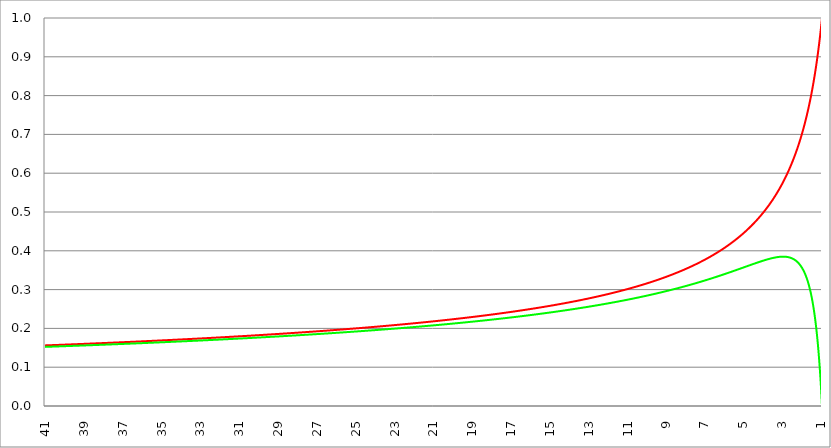
| Category | Series 1 | Series 0 | Series 2 |
|---|---|---|---|
| 41.0 | 0.156 | 0.152 |  |
| 40.98 | 0.156 | 0.152 |  |
| 40.96 | 0.156 | 0.152 |  |
| 40.94 | 0.156 | 0.152 |  |
| 40.91999999999999 | 0.156 | 0.153 |  |
| 40.89999999999998 | 0.156 | 0.153 |  |
| 40.87999999999998 | 0.156 | 0.153 |  |
| 40.85999999999998 | 0.156 | 0.153 |  |
| 40.83999999999997 | 0.156 | 0.153 |  |
| 40.81999999999997 | 0.157 | 0.153 |  |
| 40.79999999999996 | 0.157 | 0.153 |  |
| 40.77999999999996 | 0.157 | 0.153 |  |
| 40.75999999999996 | 0.157 | 0.153 |  |
| 40.73999999999995 | 0.157 | 0.153 |  |
| 40.71999999999995 | 0.157 | 0.153 |  |
| 40.69999999999995 | 0.157 | 0.153 |  |
| 40.67999999999994 | 0.157 | 0.153 |  |
| 40.65999999999994 | 0.157 | 0.153 |  |
| 40.63999999999994 | 0.157 | 0.153 |  |
| 40.61999999999994 | 0.157 | 0.153 |  |
| 40.59999999999993 | 0.157 | 0.153 |  |
| 40.57999999999993 | 0.157 | 0.153 |  |
| 40.55999999999993 | 0.157 | 0.153 |  |
| 40.53999999999992 | 0.157 | 0.153 |  |
| 40.51999999999992 | 0.157 | 0.153 |  |
| 40.49999999999992 | 0.157 | 0.153 |  |
| 40.47999999999992 | 0.157 | 0.153 |  |
| 40.45999999999992 | 0.157 | 0.153 |  |
| 40.43999999999991 | 0.157 | 0.153 |  |
| 40.41999999999991 | 0.157 | 0.153 |  |
| 40.3999999999999 | 0.157 | 0.153 |  |
| 40.3799999999999 | 0.157 | 0.153 |  |
| 40.3599999999999 | 0.157 | 0.154 |  |
| 40.3399999999999 | 0.157 | 0.154 |  |
| 40.3199999999999 | 0.157 | 0.154 |  |
| 40.2999999999999 | 0.158 | 0.154 |  |
| 40.27999999999988 | 0.158 | 0.154 |  |
| 40.25999999999988 | 0.158 | 0.154 |  |
| 40.23999999999988 | 0.158 | 0.154 |  |
| 40.21999999999987 | 0.158 | 0.154 |  |
| 40.19999999999987 | 0.158 | 0.154 |  |
| 40.17999999999987 | 0.158 | 0.154 |  |
| 40.15999999999987 | 0.158 | 0.154 |  |
| 40.13999999999986 | 0.158 | 0.154 |  |
| 40.11999999999986 | 0.158 | 0.154 |  |
| 40.09999999999985 | 0.158 | 0.154 |  |
| 40.07999999999985 | 0.158 | 0.154 |  |
| 40.05999999999985 | 0.158 | 0.154 |  |
| 40.03999999999984 | 0.158 | 0.154 |  |
| 40.01999999999984 | 0.158 | 0.154 |  |
| 39.99999999999984 | 0.158 | 0.154 |  |
| 39.97999999999984 | 0.158 | 0.154 |  |
| 39.95999999999984 | 0.158 | 0.154 |  |
| 39.93999999999983 | 0.158 | 0.154 |  |
| 39.91999999999983 | 0.158 | 0.154 |  |
| 39.89999999999982 | 0.158 | 0.154 |  |
| 39.87999999999982 | 0.158 | 0.154 |  |
| 39.85999999999982 | 0.158 | 0.154 |  |
| 39.83999999999982 | 0.158 | 0.154 |  |
| 39.81999999999982 | 0.158 | 0.154 |  |
| 39.7999999999998 | 0.159 | 0.155 |  |
| 39.7799999999998 | 0.159 | 0.155 |  |
| 39.7599999999998 | 0.159 | 0.155 |  |
| 39.7399999999998 | 0.159 | 0.155 |  |
| 39.7199999999998 | 0.159 | 0.155 |  |
| 39.6999999999998 | 0.159 | 0.155 |  |
| 39.6799999999998 | 0.159 | 0.155 |  |
| 39.6599999999998 | 0.159 | 0.155 |  |
| 39.63999999999978 | 0.159 | 0.155 |  |
| 39.61999999999978 | 0.159 | 0.155 |  |
| 39.59999999999978 | 0.159 | 0.155 |  |
| 39.57999999999977 | 0.159 | 0.155 |  |
| 39.55999999999977 | 0.159 | 0.155 |  |
| 39.53999999999977 | 0.159 | 0.155 |  |
| 39.51999999999977 | 0.159 | 0.155 |  |
| 39.49999999999976 | 0.159 | 0.155 |  |
| 39.47999999999976 | 0.159 | 0.155 |  |
| 39.45999999999976 | 0.159 | 0.155 |  |
| 39.43999999999975 | 0.159 | 0.155 |  |
| 39.41999999999975 | 0.159 | 0.155 |  |
| 39.39999999999974 | 0.159 | 0.155 |  |
| 39.37999999999974 | 0.159 | 0.155 |  |
| 39.35999999999974 | 0.159 | 0.155 |  |
| 39.33999999999974 | 0.159 | 0.155 |  |
| 39.31999999999974 | 0.159 | 0.155 |  |
| 39.29999999999973 | 0.16 | 0.155 |  |
| 39.27999999999973 | 0.16 | 0.155 |  |
| 39.25999999999972 | 0.16 | 0.156 |  |
| 39.23999999999972 | 0.16 | 0.156 |  |
| 39.21999999999972 | 0.16 | 0.156 |  |
| 39.19999999999971 | 0.16 | 0.156 |  |
| 39.17999999999971 | 0.16 | 0.156 |  |
| 39.15999999999971 | 0.16 | 0.156 |  |
| 39.1399999999997 | 0.16 | 0.156 |  |
| 39.1199999999997 | 0.16 | 0.156 |  |
| 39.0999999999997 | 0.16 | 0.156 |  |
| 39.0799999999997 | 0.16 | 0.156 |  |
| 39.0599999999997 | 0.16 | 0.156 |  |
| 39.0399999999997 | 0.16 | 0.156 |  |
| 39.0199999999997 | 0.16 | 0.156 |  |
| 38.99999999999969 | 0.16 | 0.156 |  |
| 38.97999999999968 | 0.16 | 0.156 |  |
| 38.95999999999968 | 0.16 | 0.156 |  |
| 38.93999999999968 | 0.16 | 0.156 |  |
| 38.91999999999967 | 0.16 | 0.156 |  |
| 38.89999999999967 | 0.16 | 0.156 |  |
| 38.87999999999967 | 0.16 | 0.156 |  |
| 38.85999999999967 | 0.16 | 0.156 |  |
| 38.83999999999966 | 0.16 | 0.156 |  |
| 38.81999999999966 | 0.16 | 0.156 |  |
| 38.79999999999965 | 0.161 | 0.156 |  |
| 38.77999999999965 | 0.161 | 0.156 |  |
| 38.75999999999965 | 0.161 | 0.156 |  |
| 38.73999999999964 | 0.161 | 0.157 |  |
| 38.71999999999964 | 0.161 | 0.157 |  |
| 38.69999999999964 | 0.161 | 0.157 |  |
| 38.67999999999964 | 0.161 | 0.157 |  |
| 38.65999999999963 | 0.161 | 0.157 |  |
| 38.63999999999963 | 0.161 | 0.157 |  |
| 38.61999999999963 | 0.161 | 0.157 |  |
| 38.59999999999962 | 0.161 | 0.157 |  |
| 38.57999999999962 | 0.161 | 0.157 |  |
| 38.55999999999962 | 0.161 | 0.157 |  |
| 38.53999999999962 | 0.161 | 0.157 |  |
| 38.51999999999961 | 0.161 | 0.157 |  |
| 38.49999999999961 | 0.161 | 0.157 |  |
| 38.47999999999961 | 0.161 | 0.157 |  |
| 38.4599999999996 | 0.161 | 0.157 |  |
| 38.4399999999996 | 0.161 | 0.157 |  |
| 38.4199999999996 | 0.161 | 0.157 |  |
| 38.3999999999996 | 0.161 | 0.157 |  |
| 38.3799999999996 | 0.161 | 0.157 |  |
| 38.35999999999959 | 0.161 | 0.157 |  |
| 38.33999999999958 | 0.162 | 0.157 |  |
| 38.31999999999958 | 0.162 | 0.157 |  |
| 38.29999999999957 | 0.162 | 0.157 |  |
| 38.27999999999957 | 0.162 | 0.157 |  |
| 38.25999999999957 | 0.162 | 0.157 |  |
| 38.23999999999957 | 0.162 | 0.157 |  |
| 38.21999999999957 | 0.162 | 0.158 |  |
| 38.19999999999956 | 0.162 | 0.158 |  |
| 38.17999999999956 | 0.162 | 0.158 |  |
| 38.15999999999956 | 0.162 | 0.158 |  |
| 38.13999999999955 | 0.162 | 0.158 |  |
| 38.11999999999955 | 0.162 | 0.158 |  |
| 38.09999999999954 | 0.162 | 0.158 |  |
| 38.07999999999954 | 0.162 | 0.158 |  |
| 38.05999999999954 | 0.162 | 0.158 |  |
| 38.03999999999954 | 0.162 | 0.158 |  |
| 38.01999999999953 | 0.162 | 0.158 |  |
| 37.99999999999953 | 0.162 | 0.158 |  |
| 37.97999999999953 | 0.162 | 0.158 |  |
| 37.95999999999952 | 0.162 | 0.158 |  |
| 37.93999999999952 | 0.162 | 0.158 |  |
| 37.91999999999952 | 0.162 | 0.158 |  |
| 37.89999999999952 | 0.162 | 0.158 |  |
| 37.87999999999951 | 0.162 | 0.158 |  |
| 37.85999999999951 | 0.163 | 0.158 |  |
| 37.83999999999951 | 0.163 | 0.158 |  |
| 37.8199999999995 | 0.163 | 0.158 |  |
| 37.7999999999995 | 0.163 | 0.158 |  |
| 37.7799999999995 | 0.163 | 0.158 |  |
| 37.7599999999995 | 0.163 | 0.158 |  |
| 37.7399999999995 | 0.163 | 0.158 |  |
| 37.71999999999949 | 0.163 | 0.159 |  |
| 37.69999999999948 | 0.163 | 0.159 |  |
| 37.67999999999948 | 0.163 | 0.159 |  |
| 37.65999999999948 | 0.163 | 0.159 |  |
| 37.63999999999947 | 0.163 | 0.159 |  |
| 37.61999999999947 | 0.163 | 0.159 |  |
| 37.59999999999947 | 0.163 | 0.159 |  |
| 37.57999999999947 | 0.163 | 0.159 |  |
| 37.55999999999946 | 0.163 | 0.159 |  |
| 37.53999999999946 | 0.163 | 0.159 |  |
| 37.51999999999946 | 0.163 | 0.159 |  |
| 37.49999999999945 | 0.163 | 0.159 |  |
| 37.47999999999945 | 0.163 | 0.159 |  |
| 37.45999999999945 | 0.163 | 0.159 |  |
| 37.43999999999944 | 0.163 | 0.159 |  |
| 37.41999999999944 | 0.163 | 0.159 |  |
| 37.39999999999944 | 0.164 | 0.159 |  |
| 37.37999999999943 | 0.164 | 0.159 |  |
| 37.35999999999943 | 0.164 | 0.159 |  |
| 37.33999999999943 | 0.164 | 0.159 |  |
| 37.31999999999942 | 0.164 | 0.159 |  |
| 37.29999999999942 | 0.164 | 0.159 |  |
| 37.27999999999942 | 0.164 | 0.159 |  |
| 37.25999999999942 | 0.164 | 0.159 |  |
| 37.23999999999941 | 0.164 | 0.159 |  |
| 37.21999999999941 | 0.164 | 0.16 |  |
| 37.1999999999994 | 0.164 | 0.16 |  |
| 37.1799999999994 | 0.164 | 0.16 |  |
| 37.1599999999994 | 0.164 | 0.16 |  |
| 37.1399999999994 | 0.164 | 0.16 |  |
| 37.1199999999994 | 0.164 | 0.16 |  |
| 37.0999999999994 | 0.164 | 0.16 |  |
| 37.07999999999939 | 0.164 | 0.16 |  |
| 37.05999999999938 | 0.164 | 0.16 |  |
| 37.03999999999938 | 0.164 | 0.16 |  |
| 37.01999999999938 | 0.164 | 0.16 |  |
| 36.99999999999937 | 0.164 | 0.16 |  |
| 36.97999999999937 | 0.164 | 0.16 |  |
| 36.95999999999937 | 0.164 | 0.16 |  |
| 36.93999999999937 | 0.165 | 0.16 |  |
| 36.91999999999936 | 0.165 | 0.16 |  |
| 36.89999999999936 | 0.165 | 0.16 |  |
| 36.87999999999936 | 0.165 | 0.16 |  |
| 36.85999999999935 | 0.165 | 0.16 |  |
| 36.83999999999935 | 0.165 | 0.16 |  |
| 36.81999999999935 | 0.165 | 0.16 |  |
| 36.79999999999934 | 0.165 | 0.16 |  |
| 36.77999999999934 | 0.165 | 0.16 |  |
| 36.75999999999934 | 0.165 | 0.16 |  |
| 36.73999999999933 | 0.165 | 0.16 |  |
| 36.71999999999933 | 0.165 | 0.161 |  |
| 36.69999999999932 | 0.165 | 0.161 |  |
| 36.67999999999932 | 0.165 | 0.161 |  |
| 36.65999999999932 | 0.165 | 0.161 |  |
| 36.63999999999932 | 0.165 | 0.161 |  |
| 36.61999999999932 | 0.165 | 0.161 |  |
| 36.59999999999931 | 0.165 | 0.161 |  |
| 36.57999999999931 | 0.165 | 0.161 |  |
| 36.55999999999931 | 0.165 | 0.161 |  |
| 36.5399999999993 | 0.165 | 0.161 |  |
| 36.5199999999993 | 0.165 | 0.161 |  |
| 36.4999999999993 | 0.166 | 0.161 |  |
| 36.4799999999993 | 0.166 | 0.161 |  |
| 36.4599999999993 | 0.166 | 0.161 |  |
| 36.43999999999929 | 0.166 | 0.161 |  |
| 36.41999999999928 | 0.166 | 0.161 |  |
| 36.39999999999928 | 0.166 | 0.161 |  |
| 36.37999999999928 | 0.166 | 0.161 |  |
| 36.35999999999927 | 0.166 | 0.161 |  |
| 36.33999999999927 | 0.166 | 0.161 |  |
| 36.31999999999927 | 0.166 | 0.161 |  |
| 36.29999999999926 | 0.166 | 0.161 |  |
| 36.27999999999926 | 0.166 | 0.161 |  |
| 36.25999999999926 | 0.166 | 0.161 |  |
| 36.23999999999925 | 0.166 | 0.162 |  |
| 36.21999999999925 | 0.166 | 0.162 |  |
| 36.19999999999924 | 0.166 | 0.162 |  |
| 36.17999999999924 | 0.166 | 0.162 |  |
| 36.15999999999924 | 0.166 | 0.162 |  |
| 36.13999999999924 | 0.166 | 0.162 |  |
| 36.11999999999924 | 0.166 | 0.162 |  |
| 36.09999999999923 | 0.166 | 0.162 |  |
| 36.07999999999923 | 0.166 | 0.162 |  |
| 36.05999999999923 | 0.167 | 0.162 |  |
| 36.03999999999922 | 0.167 | 0.162 |  |
| 36.01999999999922 | 0.167 | 0.162 |  |
| 35.99999999999922 | 0.167 | 0.162 |  |
| 35.97999999999922 | 0.167 | 0.162 |  |
| 35.95999999999921 | 0.167 | 0.162 |  |
| 35.93999999999921 | 0.167 | 0.162 |  |
| 35.91999999999921 | 0.167 | 0.162 |  |
| 35.8999999999992 | 0.167 | 0.162 |  |
| 35.8799999999992 | 0.167 | 0.162 |  |
| 35.8599999999992 | 0.167 | 0.162 |  |
| 35.8399999999992 | 0.167 | 0.162 |  |
| 35.8199999999992 | 0.167 | 0.162 |  |
| 35.79999999999918 | 0.167 | 0.162 |  |
| 35.77999999999918 | 0.167 | 0.163 |  |
| 35.75999999999918 | 0.167 | 0.163 |  |
| 35.73999999999917 | 0.167 | 0.163 |  |
| 35.71999999999917 | 0.167 | 0.163 |  |
| 35.69999999999917 | 0.167 | 0.163 |  |
| 35.67999999999917 | 0.167 | 0.163 |  |
| 35.65999999999917 | 0.167 | 0.163 |  |
| 35.63999999999916 | 0.168 | 0.163 |  |
| 35.61999999999916 | 0.168 | 0.163 |  |
| 35.59999999999915 | 0.168 | 0.163 |  |
| 35.57999999999915 | 0.168 | 0.163 |  |
| 35.55999999999915 | 0.168 | 0.163 |  |
| 35.53999999999914 | 0.168 | 0.163 |  |
| 35.51999999999914 | 0.168 | 0.163 |  |
| 35.49999999999914 | 0.168 | 0.163 |  |
| 35.47999999999914 | 0.168 | 0.163 |  |
| 35.45999999999913 | 0.168 | 0.163 |  |
| 35.43999999999913 | 0.168 | 0.163 |  |
| 35.41999999999913 | 0.168 | 0.163 |  |
| 35.39999999999912 | 0.168 | 0.163 |  |
| 35.37999999999912 | 0.168 | 0.163 |  |
| 35.35999999999912 | 0.168 | 0.163 |  |
| 35.33999999999912 | 0.168 | 0.163 |  |
| 35.31999999999911 | 0.168 | 0.163 |  |
| 35.2999999999991 | 0.168 | 0.164 |  |
| 35.2799999999991 | 0.168 | 0.164 |  |
| 35.2599999999991 | 0.168 | 0.164 |  |
| 35.2399999999991 | 0.168 | 0.164 |  |
| 35.2199999999991 | 0.169 | 0.164 |  |
| 35.1999999999991 | 0.169 | 0.164 |  |
| 35.1799999999991 | 0.169 | 0.164 |  |
| 35.15999999999909 | 0.169 | 0.164 |  |
| 35.13999999999908 | 0.169 | 0.164 |  |
| 35.11999999999908 | 0.169 | 0.164 |  |
| 35.09999999999907 | 0.169 | 0.164 |  |
| 35.07999999999907 | 0.169 | 0.164 |  |
| 35.05999999999907 | 0.169 | 0.164 |  |
| 35.03999999999907 | 0.169 | 0.164 |  |
| 35.01999999999907 | 0.169 | 0.164 |  |
| 34.99999999999906 | 0.169 | 0.164 |  |
| 34.97999999999906 | 0.169 | 0.164 |  |
| 34.95999999999906 | 0.169 | 0.164 |  |
| 34.93999999999905 | 0.169 | 0.164 |  |
| 34.91999999999905 | 0.169 | 0.164 |  |
| 34.89999999999904 | 0.169 | 0.164 |  |
| 34.87999999999904 | 0.169 | 0.164 |  |
| 34.85999999999904 | 0.169 | 0.165 |  |
| 34.83999999999904 | 0.169 | 0.165 |  |
| 34.81999999999903 | 0.169 | 0.165 |  |
| 34.79999999999903 | 0.17 | 0.165 |  |
| 34.77999999999902 | 0.17 | 0.165 |  |
| 34.75999999999902 | 0.17 | 0.165 |  |
| 34.73999999999902 | 0.17 | 0.165 |  |
| 34.71999999999902 | 0.17 | 0.165 |  |
| 34.69999999999901 | 0.17 | 0.165 |  |
| 34.67999999999901 | 0.17 | 0.165 |  |
| 34.65999999999901 | 0.17 | 0.165 |  |
| 34.639999999999 | 0.17 | 0.165 |  |
| 34.619999999999 | 0.17 | 0.165 |  |
| 34.599999999999 | 0.17 | 0.165 |  |
| 34.579999999999 | 0.17 | 0.165 |  |
| 34.559999999999 | 0.17 | 0.165 |  |
| 34.539999999999 | 0.17 | 0.165 |  |
| 34.51999999999899 | 0.17 | 0.165 |  |
| 34.49999999999898 | 0.17 | 0.165 |  |
| 34.47999999999898 | 0.17 | 0.165 |  |
| 34.45999999999898 | 0.17 | 0.165 |  |
| 34.43999999999897 | 0.17 | 0.165 |  |
| 34.41999999999897 | 0.17 | 0.165 |  |
| 34.39999999999897 | 0.17 | 0.166 |  |
| 34.37999999999897 | 0.171 | 0.166 |  |
| 34.35999999999896 | 0.171 | 0.166 |  |
| 34.33999999999896 | 0.171 | 0.166 |  |
| 34.31999999999896 | 0.171 | 0.166 |  |
| 34.29999999999895 | 0.171 | 0.166 |  |
| 34.27999999999894 | 0.171 | 0.166 |  |
| 34.25999999999894 | 0.171 | 0.166 |  |
| 34.23999999999894 | 0.171 | 0.166 |  |
| 34.21999999999894 | 0.171 | 0.166 |  |
| 34.19999999999893 | 0.171 | 0.166 |  |
| 34.17999999999893 | 0.171 | 0.166 |  |
| 34.15999999999893 | 0.171 | 0.166 |  |
| 34.13999999999892 | 0.171 | 0.166 |  |
| 34.11999999999892 | 0.171 | 0.166 |  |
| 34.09999999999892 | 0.171 | 0.166 |  |
| 34.07999999999892 | 0.171 | 0.166 |  |
| 34.05999999999892 | 0.171 | 0.166 |  |
| 34.03999999999891 | 0.171 | 0.166 |  |
| 34.01999999999891 | 0.171 | 0.166 |  |
| 33.9999999999989 | 0.171 | 0.166 |  |
| 33.9799999999989 | 0.172 | 0.167 |  |
| 33.9599999999989 | 0.172 | 0.167 |  |
| 33.9399999999989 | 0.172 | 0.167 |  |
| 33.9199999999989 | 0.172 | 0.167 |  |
| 33.8999999999989 | 0.172 | 0.167 |  |
| 33.87999999999889 | 0.172 | 0.167 |  |
| 33.85999999999888 | 0.172 | 0.167 |  |
| 33.83999999999888 | 0.172 | 0.167 |  |
| 33.81999999999888 | 0.172 | 0.167 |  |
| 33.79999999999887 | 0.172 | 0.167 |  |
| 33.77999999999887 | 0.172 | 0.167 |  |
| 33.75999999999887 | 0.172 | 0.167 |  |
| 33.73999999999886 | 0.172 | 0.167 |  |
| 33.71999999999886 | 0.172 | 0.167 |  |
| 33.69999999999885 | 0.172 | 0.167 |  |
| 33.67999999999885 | 0.172 | 0.167 |  |
| 33.65999999999885 | 0.172 | 0.167 |  |
| 33.63999999999884 | 0.172 | 0.167 |  |
| 33.61999999999884 | 0.172 | 0.167 |  |
| 33.59999999999884 | 0.173 | 0.167 |  |
| 33.57999999999884 | 0.173 | 0.167 |  |
| 33.55999999999884 | 0.173 | 0.167 |  |
| 33.53999999999883 | 0.173 | 0.168 |  |
| 33.51999999999883 | 0.173 | 0.168 |  |
| 33.49999999999882 | 0.173 | 0.168 |  |
| 33.47999999999882 | 0.173 | 0.168 |  |
| 33.45999999999882 | 0.173 | 0.168 |  |
| 33.43999999999882 | 0.173 | 0.168 |  |
| 33.41999999999882 | 0.173 | 0.168 |  |
| 33.39999999999881 | 0.173 | 0.168 |  |
| 33.37999999999881 | 0.173 | 0.168 |  |
| 33.35999999999881 | 0.173 | 0.168 |  |
| 33.3399999999988 | 0.173 | 0.168 |  |
| 33.3199999999988 | 0.173 | 0.168 |  |
| 33.2999999999988 | 0.173 | 0.168 |  |
| 33.2799999999988 | 0.173 | 0.168 |  |
| 33.2599999999988 | 0.173 | 0.168 |  |
| 33.23999999999878 | 0.173 | 0.168 |  |
| 33.21999999999878 | 0.174 | 0.168 |  |
| 33.19999999999878 | 0.174 | 0.168 |  |
| 33.17999999999877 | 0.174 | 0.168 |  |
| 33.15999999999877 | 0.174 | 0.168 |  |
| 33.13999999999877 | 0.174 | 0.168 |  |
| 33.11999999999877 | 0.174 | 0.169 |  |
| 33.09999999999876 | 0.174 | 0.169 |  |
| 33.07999999999876 | 0.174 | 0.169 |  |
| 33.05999999999876 | 0.174 | 0.169 |  |
| 33.03999999999875 | 0.174 | 0.169 |  |
| 33.01999999999875 | 0.174 | 0.169 |  |
| 32.99999999999874 | 0.174 | 0.169 |  |
| 32.97999999999874 | 0.174 | 0.169 |  |
| 32.95999999999874 | 0.174 | 0.169 |  |
| 32.93999999999874 | 0.174 | 0.169 |  |
| 32.91999999999874 | 0.174 | 0.169 |  |
| 32.89999999999873 | 0.174 | 0.169 |  |
| 32.87999999999873 | 0.174 | 0.169 |  |
| 32.85999999999873 | 0.174 | 0.169 |  |
| 32.83999999999872 | 0.175 | 0.169 |  |
| 32.81999999999872 | 0.175 | 0.169 |  |
| 32.79999999999871 | 0.175 | 0.169 |  |
| 32.77999999999871 | 0.175 | 0.169 |  |
| 32.75999999999871 | 0.175 | 0.169 |  |
| 32.7399999999987 | 0.175 | 0.169 |  |
| 32.7199999999987 | 0.175 | 0.169 |  |
| 32.6999999999987 | 0.175 | 0.17 |  |
| 32.6799999999987 | 0.175 | 0.17 |  |
| 32.6599999999987 | 0.175 | 0.17 |  |
| 32.6399999999987 | 0.175 | 0.17 |  |
| 32.61999999999869 | 0.175 | 0.17 |  |
| 32.59999999999869 | 0.175 | 0.17 |  |
| 32.57999999999868 | 0.175 | 0.17 |  |
| 32.55999999999868 | 0.175 | 0.17 |  |
| 32.53999999999868 | 0.175 | 0.17 |  |
| 32.51999999999867 | 0.175 | 0.17 |  |
| 32.49999999999867 | 0.175 | 0.17 |  |
| 32.47999999999867 | 0.175 | 0.17 |  |
| 32.45999999999866 | 0.176 | 0.17 |  |
| 32.43999999999866 | 0.176 | 0.17 |  |
| 32.41999999999866 | 0.176 | 0.17 |  |
| 32.39999999999866 | 0.176 | 0.17 |  |
| 32.37999999999865 | 0.176 | 0.17 |  |
| 32.35999999999865 | 0.176 | 0.17 |  |
| 32.33999999999865 | 0.176 | 0.17 |  |
| 32.31999999999864 | 0.176 | 0.17 |  |
| 32.29999999999864 | 0.176 | 0.171 |  |
| 32.27999999999864 | 0.176 | 0.171 |  |
| 32.25999999999863 | 0.176 | 0.171 |  |
| 32.23999999999863 | 0.176 | 0.171 |  |
| 32.21999999999863 | 0.176 | 0.171 |  |
| 32.19999999999862 | 0.176 | 0.171 |  |
| 32.17999999999862 | 0.176 | 0.171 |  |
| 32.15999999999862 | 0.176 | 0.171 |  |
| 32.13999999999861 | 0.176 | 0.171 |  |
| 32.11999999999861 | 0.176 | 0.171 |  |
| 32.09999999999861 | 0.177 | 0.171 |  |
| 32.07999999999861 | 0.177 | 0.171 |  |
| 32.0599999999986 | 0.177 | 0.171 |  |
| 32.0399999999986 | 0.177 | 0.171 |  |
| 32.0199999999986 | 0.177 | 0.171 |  |
| 31.9999999999986 | 0.177 | 0.171 |  |
| 31.9799999999986 | 0.177 | 0.171 |  |
| 31.9599999999986 | 0.177 | 0.171 |  |
| 31.9399999999986 | 0.177 | 0.171 |  |
| 31.9199999999986 | 0.177 | 0.171 |  |
| 31.8999999999986 | 0.177 | 0.172 |  |
| 31.8799999999986 | 0.177 | 0.172 |  |
| 31.8599999999986 | 0.177 | 0.172 |  |
| 31.8399999999986 | 0.177 | 0.172 |  |
| 31.8199999999986 | 0.177 | 0.172 |  |
| 31.7999999999986 | 0.177 | 0.172 |  |
| 31.7799999999986 | 0.177 | 0.172 |  |
| 31.7599999999986 | 0.177 | 0.172 |  |
| 31.7399999999986 | 0.177 | 0.172 |  |
| 31.7199999999986 | 0.178 | 0.172 |  |
| 31.6999999999986 | 0.178 | 0.172 |  |
| 31.6799999999986 | 0.178 | 0.172 |  |
| 31.6599999999986 | 0.178 | 0.172 |  |
| 31.6399999999986 | 0.178 | 0.172 |  |
| 31.6199999999986 | 0.178 | 0.172 |  |
| 31.59999999999861 | 0.178 | 0.172 |  |
| 31.57999999999861 | 0.178 | 0.172 |  |
| 31.55999999999861 | 0.178 | 0.172 |  |
| 31.53999999999861 | 0.178 | 0.172 |  |
| 31.51999999999861 | 0.178 | 0.172 |  |
| 31.49999999999861 | 0.178 | 0.173 |  |
| 31.47999999999861 | 0.178 | 0.173 |  |
| 31.45999999999861 | 0.178 | 0.173 |  |
| 31.43999999999861 | 0.178 | 0.173 |  |
| 31.41999999999861 | 0.178 | 0.173 |  |
| 31.39999999999861 | 0.178 | 0.173 |  |
| 31.37999999999861 | 0.179 | 0.173 |  |
| 31.35999999999861 | 0.179 | 0.173 |  |
| 31.33999999999861 | 0.179 | 0.173 |  |
| 31.31999999999861 | 0.179 | 0.173 |  |
| 31.29999999999861 | 0.179 | 0.173 |  |
| 31.27999999999861 | 0.179 | 0.173 |  |
| 31.25999999999861 | 0.179 | 0.173 |  |
| 31.23999999999861 | 0.179 | 0.173 |  |
| 31.21999999999861 | 0.179 | 0.173 |  |
| 31.19999999999861 | 0.179 | 0.173 |  |
| 31.17999999999861 | 0.179 | 0.173 |  |
| 31.15999999999861 | 0.179 | 0.173 |  |
| 31.13999999999861 | 0.179 | 0.173 |  |
| 31.11999999999861 | 0.179 | 0.173 |  |
| 31.09999999999862 | 0.179 | 0.174 |  |
| 31.07999999999862 | 0.179 | 0.174 |  |
| 31.05999999999862 | 0.179 | 0.174 |  |
| 31.03999999999862 | 0.179 | 0.174 |  |
| 31.01999999999862 | 0.18 | 0.174 |  |
| 30.99999999999862 | 0.18 | 0.174 |  |
| 30.97999999999862 | 0.18 | 0.174 |  |
| 30.95999999999862 | 0.18 | 0.174 |  |
| 30.93999999999862 | 0.18 | 0.174 |  |
| 30.91999999999862 | 0.18 | 0.174 |  |
| 30.89999999999862 | 0.18 | 0.174 |  |
| 30.87999999999862 | 0.18 | 0.174 |  |
| 30.85999999999862 | 0.18 | 0.174 |  |
| 30.83999999999862 | 0.18 | 0.174 |  |
| 30.81999999999862 | 0.18 | 0.174 |  |
| 30.79999999999862 | 0.18 | 0.174 |  |
| 30.77999999999862 | 0.18 | 0.174 |  |
| 30.75999999999862 | 0.18 | 0.174 |  |
| 30.73999999999862 | 0.18 | 0.174 |  |
| 30.71999999999862 | 0.18 | 0.175 |  |
| 30.69999999999862 | 0.18 | 0.175 |  |
| 30.67999999999862 | 0.181 | 0.175 |  |
| 30.65999999999862 | 0.181 | 0.175 |  |
| 30.63999999999862 | 0.181 | 0.175 |  |
| 30.61999999999862 | 0.181 | 0.175 |  |
| 30.59999999999863 | 0.181 | 0.175 |  |
| 30.57999999999863 | 0.181 | 0.175 |  |
| 30.55999999999863 | 0.181 | 0.175 |  |
| 30.53999999999863 | 0.181 | 0.175 |  |
| 30.51999999999863 | 0.181 | 0.175 |  |
| 30.49999999999863 | 0.181 | 0.175 |  |
| 30.47999999999863 | 0.181 | 0.175 |  |
| 30.45999999999863 | 0.181 | 0.175 |  |
| 30.43999999999863 | 0.181 | 0.175 |  |
| 30.41999999999863 | 0.181 | 0.175 |  |
| 30.39999999999863 | 0.181 | 0.175 |  |
| 30.37999999999863 | 0.181 | 0.175 |  |
| 30.35999999999863 | 0.181 | 0.176 |  |
| 30.33999999999863 | 0.182 | 0.176 |  |
| 30.31999999999863 | 0.182 | 0.176 |  |
| 30.29999999999863 | 0.182 | 0.176 |  |
| 30.27999999999863 | 0.182 | 0.176 |  |
| 30.25999999999863 | 0.182 | 0.176 |  |
| 30.23999999999863 | 0.182 | 0.176 |  |
| 30.21999999999863 | 0.182 | 0.176 |  |
| 30.19999999999864 | 0.182 | 0.176 |  |
| 30.17999999999864 | 0.182 | 0.176 |  |
| 30.15999999999864 | 0.182 | 0.176 |  |
| 30.13999999999864 | 0.182 | 0.176 |  |
| 30.11999999999864 | 0.182 | 0.176 |  |
| 30.09999999999864 | 0.182 | 0.176 |  |
| 30.07999999999864 | 0.182 | 0.176 |  |
| 30.05999999999864 | 0.182 | 0.176 |  |
| 30.03999999999864 | 0.182 | 0.176 |  |
| 30.01999999999864 | 0.183 | 0.176 |  |
| 29.99999999999864 | 0.183 | 0.176 |  |
| 29.97999999999864 | 0.183 | 0.177 |  |
| 29.95999999999864 | 0.183 | 0.177 |  |
| 29.93999999999864 | 0.183 | 0.177 |  |
| 29.91999999999864 | 0.183 | 0.177 |  |
| 29.89999999999864 | 0.183 | 0.177 |  |
| 29.87999999999864 | 0.183 | 0.177 |  |
| 29.85999999999864 | 0.183 | 0.177 |  |
| 29.83999999999864 | 0.183 | 0.177 |  |
| 29.81999999999864 | 0.183 | 0.177 |  |
| 29.79999999999864 | 0.183 | 0.177 |  |
| 29.77999999999864 | 0.183 | 0.177 |  |
| 29.75999999999864 | 0.183 | 0.177 |  |
| 29.73999999999864 | 0.183 | 0.177 |  |
| 29.71999999999865 | 0.183 | 0.177 |  |
| 29.69999999999865 | 0.183 | 0.177 |  |
| 29.67999999999865 | 0.184 | 0.177 |  |
| 29.65999999999865 | 0.184 | 0.177 |  |
| 29.63999999999865 | 0.184 | 0.177 |  |
| 29.61999999999865 | 0.184 | 0.178 |  |
| 29.59999999999865 | 0.184 | 0.178 |  |
| 29.57999999999865 | 0.184 | 0.178 |  |
| 29.55999999999865 | 0.184 | 0.178 |  |
| 29.53999999999865 | 0.184 | 0.178 |  |
| 29.51999999999865 | 0.184 | 0.178 |  |
| 29.49999999999865 | 0.184 | 0.178 |  |
| 29.47999999999865 | 0.184 | 0.178 |  |
| 29.45999999999865 | 0.184 | 0.178 |  |
| 29.43999999999865 | 0.184 | 0.178 |  |
| 29.41999999999865 | 0.184 | 0.178 |  |
| 29.39999999999865 | 0.184 | 0.178 |  |
| 29.37999999999865 | 0.184 | 0.178 |  |
| 29.35999999999865 | 0.185 | 0.178 |  |
| 29.33999999999865 | 0.185 | 0.178 |  |
| 29.31999999999865 | 0.185 | 0.178 |  |
| 29.29999999999865 | 0.185 | 0.178 |  |
| 29.27999999999865 | 0.185 | 0.178 |  |
| 29.25999999999866 | 0.185 | 0.179 |  |
| 29.23999999999866 | 0.185 | 0.179 |  |
| 29.21999999999866 | 0.185 | 0.179 |  |
| 29.19999999999866 | 0.185 | 0.179 |  |
| 29.17999999999866 | 0.185 | 0.179 |  |
| 29.15999999999866 | 0.185 | 0.179 |  |
| 29.13999999999866 | 0.185 | 0.179 |  |
| 29.11999999999866 | 0.185 | 0.179 |  |
| 29.09999999999866 | 0.185 | 0.179 |  |
| 29.07999999999866 | 0.185 | 0.179 |  |
| 29.05999999999866 | 0.186 | 0.179 |  |
| 29.03999999999866 | 0.186 | 0.179 |  |
| 29.01999999999866 | 0.186 | 0.179 |  |
| 28.99999999999866 | 0.186 | 0.179 |  |
| 28.97999999999866 | 0.186 | 0.179 |  |
| 28.95999999999866 | 0.186 | 0.179 |  |
| 28.93999999999866 | 0.186 | 0.179 |  |
| 28.91999999999866 | 0.186 | 0.18 |  |
| 28.89999999999866 | 0.186 | 0.18 |  |
| 28.87999999999866 | 0.186 | 0.18 |  |
| 28.85999999999866 | 0.186 | 0.18 |  |
| 28.83999999999866 | 0.186 | 0.18 |  |
| 28.81999999999866 | 0.186 | 0.18 |  |
| 28.79999999999866 | 0.186 | 0.18 |  |
| 28.77999999999867 | 0.186 | 0.18 |  |
| 28.75999999999867 | 0.186 | 0.18 |  |
| 28.73999999999867 | 0.187 | 0.18 |  |
| 28.71999999999867 | 0.187 | 0.18 |  |
| 28.69999999999867 | 0.187 | 0.18 |  |
| 28.67999999999867 | 0.187 | 0.18 |  |
| 28.65999999999867 | 0.187 | 0.18 |  |
| 28.63999999999867 | 0.187 | 0.18 |  |
| 28.61999999999867 | 0.187 | 0.18 |  |
| 28.59999999999867 | 0.187 | 0.18 |  |
| 28.57999999999867 | 0.187 | 0.181 |  |
| 28.55999999999867 | 0.187 | 0.181 |  |
| 28.53999999999867 | 0.187 | 0.181 |  |
| 28.51999999999867 | 0.187 | 0.181 |  |
| 28.49999999999867 | 0.187 | 0.181 |  |
| 28.47999999999867 | 0.187 | 0.181 |  |
| 28.45999999999867 | 0.187 | 0.181 |  |
| 28.43999999999867 | 0.188 | 0.181 |  |
| 28.41999999999867 | 0.188 | 0.181 |  |
| 28.39999999999867 | 0.188 | 0.181 |  |
| 28.37999999999867 | 0.188 | 0.181 |  |
| 28.35999999999867 | 0.188 | 0.181 |  |
| 28.33999999999867 | 0.188 | 0.181 |  |
| 28.31999999999867 | 0.188 | 0.181 |  |
| 28.29999999999868 | 0.188 | 0.181 |  |
| 28.27999999999868 | 0.188 | 0.181 |  |
| 28.25999999999868 | 0.188 | 0.181 |  |
| 28.23999999999868 | 0.188 | 0.182 |  |
| 28.21999999999868 | 0.188 | 0.182 |  |
| 28.19999999999868 | 0.188 | 0.182 |  |
| 28.17999999999868 | 0.188 | 0.182 |  |
| 28.15999999999868 | 0.188 | 0.182 |  |
| 28.13999999999868 | 0.189 | 0.182 |  |
| 28.11999999999868 | 0.189 | 0.182 |  |
| 28.09999999999868 | 0.189 | 0.182 |  |
| 28.07999999999868 | 0.189 | 0.182 |  |
| 28.05999999999868 | 0.189 | 0.182 |  |
| 28.03999999999868 | 0.189 | 0.182 |  |
| 28.01999999999868 | 0.189 | 0.182 |  |
| 27.99999999999868 | 0.189 | 0.182 |  |
| 27.97999999999868 | 0.189 | 0.182 |  |
| 27.95999999999868 | 0.189 | 0.182 |  |
| 27.93999999999868 | 0.189 | 0.182 |  |
| 27.91999999999868 | 0.189 | 0.182 |  |
| 27.89999999999868 | 0.189 | 0.183 |  |
| 27.87999999999868 | 0.189 | 0.183 |  |
| 27.85999999999868 | 0.189 | 0.183 |  |
| 27.83999999999868 | 0.19 | 0.183 |  |
| 27.81999999999868 | 0.19 | 0.183 |  |
| 27.79999999999869 | 0.19 | 0.183 |  |
| 27.77999999999869 | 0.19 | 0.183 |  |
| 27.75999999999869 | 0.19 | 0.183 |  |
| 27.73999999999869 | 0.19 | 0.183 |  |
| 27.71999999999869 | 0.19 | 0.183 |  |
| 27.69999999999869 | 0.19 | 0.183 |  |
| 27.67999999999869 | 0.19 | 0.183 |  |
| 27.65999999999869 | 0.19 | 0.183 |  |
| 27.63999999999869 | 0.19 | 0.183 |  |
| 27.61999999999869 | 0.19 | 0.183 |  |
| 27.5999999999987 | 0.19 | 0.183 |  |
| 27.5799999999987 | 0.19 | 0.184 |  |
| 27.5599999999987 | 0.19 | 0.184 |  |
| 27.5399999999987 | 0.191 | 0.184 |  |
| 27.5199999999987 | 0.191 | 0.184 |  |
| 27.49999999999869 | 0.191 | 0.184 |  |
| 27.47999999999869 | 0.191 | 0.184 |  |
| 27.45999999999869 | 0.191 | 0.184 |  |
| 27.43999999999869 | 0.191 | 0.184 |  |
| 27.41999999999869 | 0.191 | 0.184 |  |
| 27.39999999999869 | 0.191 | 0.184 |  |
| 27.3799999999987 | 0.191 | 0.184 |  |
| 27.3599999999987 | 0.191 | 0.184 |  |
| 27.3399999999987 | 0.191 | 0.184 |  |
| 27.3199999999987 | 0.191 | 0.184 |  |
| 27.2999999999987 | 0.191 | 0.184 |  |
| 27.2799999999987 | 0.191 | 0.184 |  |
| 27.2599999999987 | 0.192 | 0.185 |  |
| 27.2399999999987 | 0.192 | 0.185 |  |
| 27.2199999999987 | 0.192 | 0.185 |  |
| 27.1999999999987 | 0.192 | 0.185 |  |
| 27.1799999999987 | 0.192 | 0.185 |  |
| 27.1599999999987 | 0.192 | 0.185 |  |
| 27.1399999999987 | 0.192 | 0.185 |  |
| 27.1199999999987 | 0.192 | 0.185 |  |
| 27.0999999999987 | 0.192 | 0.185 |  |
| 27.0799999999987 | 0.192 | 0.185 |  |
| 27.0599999999987 | 0.192 | 0.185 |  |
| 27.0399999999987 | 0.192 | 0.185 |  |
| 27.0199999999987 | 0.192 | 0.185 |  |
| 26.9999999999987 | 0.192 | 0.185 |  |
| 26.9799999999987 | 0.193 | 0.185 |  |
| 26.9599999999987 | 0.193 | 0.185 |  |
| 26.9399999999987 | 0.193 | 0.186 |  |
| 26.9199999999987 | 0.193 | 0.186 |  |
| 26.89999999999871 | 0.193 | 0.186 |  |
| 26.87999999999871 | 0.193 | 0.186 |  |
| 26.85999999999871 | 0.193 | 0.186 |  |
| 26.83999999999871 | 0.193 | 0.186 |  |
| 26.81999999999871 | 0.193 | 0.186 |  |
| 26.79999999999871 | 0.193 | 0.186 |  |
| 26.77999999999871 | 0.193 | 0.186 |  |
| 26.75999999999871 | 0.193 | 0.186 |  |
| 26.73999999999871 | 0.193 | 0.186 |  |
| 26.71999999999871 | 0.193 | 0.186 |  |
| 26.69999999999871 | 0.194 | 0.186 |  |
| 26.67999999999871 | 0.194 | 0.186 |  |
| 26.65999999999871 | 0.194 | 0.186 |  |
| 26.63999999999871 | 0.194 | 0.186 |  |
| 26.61999999999871 | 0.194 | 0.187 |  |
| 26.59999999999871 | 0.194 | 0.187 |  |
| 26.57999999999871 | 0.194 | 0.187 |  |
| 26.55999999999871 | 0.194 | 0.187 |  |
| 26.53999999999871 | 0.194 | 0.187 |  |
| 26.51999999999871 | 0.194 | 0.187 |  |
| 26.49999999999871 | 0.194 | 0.187 |  |
| 26.47999999999871 | 0.194 | 0.187 |  |
| 26.45999999999871 | 0.194 | 0.187 |  |
| 26.43999999999872 | 0.194 | 0.187 |  |
| 26.41999999999872 | 0.195 | 0.187 |  |
| 26.39999999999872 | 0.195 | 0.187 |  |
| 26.37999999999872 | 0.195 | 0.187 |  |
| 26.35999999999872 | 0.195 | 0.187 |  |
| 26.33999999999872 | 0.195 | 0.187 |  |
| 26.31999999999872 | 0.195 | 0.188 |  |
| 26.29999999999872 | 0.195 | 0.188 |  |
| 26.27999999999872 | 0.195 | 0.188 |  |
| 26.25999999999872 | 0.195 | 0.188 |  |
| 26.23999999999872 | 0.195 | 0.188 |  |
| 26.21999999999872 | 0.195 | 0.188 |  |
| 26.19999999999872 | 0.195 | 0.188 |  |
| 26.17999999999872 | 0.195 | 0.188 |  |
| 26.15999999999872 | 0.196 | 0.188 |  |
| 26.13999999999872 | 0.196 | 0.188 |  |
| 26.11999999999872 | 0.196 | 0.188 |  |
| 26.09999999999872 | 0.196 | 0.188 |  |
| 26.07999999999872 | 0.196 | 0.188 |  |
| 26.05999999999872 | 0.196 | 0.188 |  |
| 26.03999999999872 | 0.196 | 0.188 |  |
| 26.01999999999872 | 0.196 | 0.189 |  |
| 25.99999999999872 | 0.196 | 0.189 |  |
| 25.97999999999872 | 0.196 | 0.189 |  |
| 25.95999999999873 | 0.196 | 0.189 |  |
| 25.93999999999873 | 0.196 | 0.189 |  |
| 25.91999999999873 | 0.196 | 0.189 |  |
| 25.89999999999873 | 0.196 | 0.189 |  |
| 25.87999999999873 | 0.197 | 0.189 |  |
| 25.85999999999873 | 0.197 | 0.189 |  |
| 25.83999999999873 | 0.197 | 0.189 |  |
| 25.81999999999873 | 0.197 | 0.189 |  |
| 25.79999999999873 | 0.197 | 0.189 |  |
| 25.77999999999873 | 0.197 | 0.189 |  |
| 25.75999999999873 | 0.197 | 0.189 |  |
| 25.73999999999873 | 0.197 | 0.189 |  |
| 25.71999999999873 | 0.197 | 0.19 |  |
| 25.69999999999873 | 0.197 | 0.19 |  |
| 25.67999999999873 | 0.197 | 0.19 |  |
| 25.65999999999873 | 0.197 | 0.19 |  |
| 25.63999999999873 | 0.197 | 0.19 |  |
| 25.61999999999873 | 0.198 | 0.19 |  |
| 25.59999999999873 | 0.198 | 0.19 |  |
| 25.57999999999873 | 0.198 | 0.19 |  |
| 25.55999999999873 | 0.198 | 0.19 |  |
| 25.53999999999873 | 0.198 | 0.19 |  |
| 25.51999999999873 | 0.198 | 0.19 |  |
| 25.49999999999874 | 0.198 | 0.19 |  |
| 25.47999999999874 | 0.198 | 0.19 |  |
| 25.45999999999874 | 0.198 | 0.19 |  |
| 25.43999999999874 | 0.198 | 0.19 |  |
| 25.41999999999874 | 0.198 | 0.191 |  |
| 25.39999999999874 | 0.198 | 0.191 |  |
| 25.37999999999874 | 0.198 | 0.191 |  |
| 25.35999999999874 | 0.199 | 0.191 |  |
| 25.33999999999874 | 0.199 | 0.191 |  |
| 25.31999999999874 | 0.199 | 0.191 |  |
| 25.29999999999874 | 0.199 | 0.191 |  |
| 25.27999999999874 | 0.199 | 0.191 |  |
| 25.25999999999874 | 0.199 | 0.191 |  |
| 25.23999999999874 | 0.199 | 0.191 |  |
| 25.21999999999874 | 0.199 | 0.191 |  |
| 25.19999999999874 | 0.199 | 0.191 |  |
| 25.17999999999874 | 0.199 | 0.191 |  |
| 25.15999999999874 | 0.199 | 0.191 |  |
| 25.13999999999874 | 0.199 | 0.192 |  |
| 25.11999999999874 | 0.2 | 0.192 |  |
| 25.09999999999874 | 0.2 | 0.192 |  |
| 25.07999999999874 | 0.2 | 0.192 |  |
| 25.05999999999874 | 0.2 | 0.192 |  |
| 25.03999999999875 | 0.2 | 0.192 |  |
| 25.01999999999875 | 0.2 | 0.192 |  |
| 24.99999999999875 | 0.2 | 0.192 |  |
| 24.97999999999875 | 0.2 | 0.192 |  |
| 24.95999999999875 | 0.2 | 0.192 |  |
| 24.93999999999875 | 0.2 | 0.192 |  |
| 24.91999999999875 | 0.2 | 0.192 |  |
| 24.89999999999875 | 0.2 | 0.192 |  |
| 24.87999999999875 | 0.2 | 0.192 |  |
| 24.85999999999875 | 0.201 | 0.192 |  |
| 24.83999999999875 | 0.201 | 0.193 |  |
| 24.81999999999875 | 0.201 | 0.193 |  |
| 24.79999999999875 | 0.201 | 0.193 |  |
| 24.77999999999875 | 0.201 | 0.193 |  |
| 24.75999999999875 | 0.201 | 0.193 |  |
| 24.73999999999875 | 0.201 | 0.193 |  |
| 24.71999999999875 | 0.201 | 0.193 |  |
| 24.69999999999875 | 0.201 | 0.193 |  |
| 24.67999999999875 | 0.201 | 0.193 |  |
| 24.65999999999875 | 0.201 | 0.193 |  |
| 24.63999999999875 | 0.201 | 0.193 |  |
| 24.61999999999875 | 0.202 | 0.193 |  |
| 24.59999999999875 | 0.202 | 0.193 |  |
| 24.57999999999875 | 0.202 | 0.193 |  |
| 24.55999999999876 | 0.202 | 0.194 |  |
| 24.53999999999876 | 0.202 | 0.194 |  |
| 24.51999999999876 | 0.202 | 0.194 |  |
| 24.49999999999876 | 0.202 | 0.194 |  |
| 24.47999999999876 | 0.202 | 0.194 |  |
| 24.45999999999876 | 0.202 | 0.194 |  |
| 24.43999999999876 | 0.202 | 0.194 |  |
| 24.41999999999876 | 0.202 | 0.194 |  |
| 24.39999999999876 | 0.202 | 0.194 |  |
| 24.37999999999876 | 0.203 | 0.194 |  |
| 24.35999999999876 | 0.203 | 0.194 |  |
| 24.33999999999876 | 0.203 | 0.194 |  |
| 24.31999999999876 | 0.203 | 0.194 |  |
| 24.29999999999876 | 0.203 | 0.195 |  |
| 24.27999999999876 | 0.203 | 0.195 |  |
| 24.25999999999876 | 0.203 | 0.195 |  |
| 24.23999999999876 | 0.203 | 0.195 |  |
| 24.21999999999876 | 0.203 | 0.195 |  |
| 24.19999999999876 | 0.203 | 0.195 |  |
| 24.17999999999876 | 0.203 | 0.195 |  |
| 24.15999999999876 | 0.203 | 0.195 |  |
| 24.13999999999876 | 0.204 | 0.195 |  |
| 24.11999999999876 | 0.204 | 0.195 |  |
| 24.09999999999877 | 0.204 | 0.195 |  |
| 24.07999999999877 | 0.204 | 0.195 |  |
| 24.05999999999877 | 0.204 | 0.195 |  |
| 24.03999999999877 | 0.204 | 0.195 |  |
| 24.01999999999877 | 0.204 | 0.196 |  |
| 23.99999999999877 | 0.204 | 0.196 |  |
| 23.97999999999877 | 0.204 | 0.196 |  |
| 23.95999999999877 | 0.204 | 0.196 |  |
| 23.93999999999877 | 0.204 | 0.196 |  |
| 23.91999999999877 | 0.204 | 0.196 |  |
| 23.89999999999877 | 0.205 | 0.196 |  |
| 23.87999999999877 | 0.205 | 0.196 |  |
| 23.85999999999877 | 0.205 | 0.196 |  |
| 23.83999999999877 | 0.205 | 0.196 |  |
| 23.81999999999877 | 0.205 | 0.196 |  |
| 23.79999999999877 | 0.205 | 0.196 |  |
| 23.77999999999877 | 0.205 | 0.196 |  |
| 23.75999999999877 | 0.205 | 0.197 |  |
| 23.73999999999877 | 0.205 | 0.197 |  |
| 23.71999999999877 | 0.205 | 0.197 |  |
| 23.69999999999877 | 0.205 | 0.197 |  |
| 23.67999999999877 | 0.205 | 0.197 |  |
| 23.65999999999877 | 0.206 | 0.197 |  |
| 23.63999999999877 | 0.206 | 0.197 |  |
| 23.61999999999877 | 0.206 | 0.197 |  |
| 23.59999999999878 | 0.206 | 0.197 |  |
| 23.57999999999878 | 0.206 | 0.197 |  |
| 23.55999999999878 | 0.206 | 0.197 |  |
| 23.53999999999878 | 0.206 | 0.197 |  |
| 23.51999999999878 | 0.206 | 0.197 |  |
| 23.49999999999878 | 0.206 | 0.198 |  |
| 23.47999999999878 | 0.206 | 0.198 |  |
| 23.45999999999878 | 0.206 | 0.198 |  |
| 23.43999999999878 | 0.207 | 0.198 |  |
| 23.41999999999878 | 0.207 | 0.198 |  |
| 23.39999999999878 | 0.207 | 0.198 |  |
| 23.37999999999878 | 0.207 | 0.198 |  |
| 23.35999999999878 | 0.207 | 0.198 |  |
| 23.33999999999878 | 0.207 | 0.198 |  |
| 23.31999999999878 | 0.207 | 0.198 |  |
| 23.29999999999878 | 0.207 | 0.198 |  |
| 23.27999999999878 | 0.207 | 0.198 |  |
| 23.25999999999878 | 0.207 | 0.198 |  |
| 23.23999999999878 | 0.207 | 0.199 |  |
| 23.21999999999878 | 0.208 | 0.199 |  |
| 23.19999999999878 | 0.208 | 0.199 |  |
| 23.17999999999878 | 0.208 | 0.199 |  |
| 23.15999999999878 | 0.208 | 0.199 |  |
| 23.13999999999878 | 0.208 | 0.199 |  |
| 23.11999999999878 | 0.208 | 0.199 |  |
| 23.09999999999879 | 0.208 | 0.199 |  |
| 23.07999999999879 | 0.208 | 0.199 |  |
| 23.05999999999879 | 0.208 | 0.199 |  |
| 23.03999999999879 | 0.208 | 0.199 |  |
| 23.01999999999879 | 0.208 | 0.199 |  |
| 22.99999999999879 | 0.209 | 0.199 |  |
| 22.97999999999879 | 0.209 | 0.2 |  |
| 22.95999999999879 | 0.209 | 0.2 |  |
| 22.93999999999879 | 0.209 | 0.2 |  |
| 22.9199999999988 | 0.209 | 0.2 |  |
| 22.8999999999988 | 0.209 | 0.2 |  |
| 22.8799999999988 | 0.209 | 0.2 |  |
| 22.8599999999988 | 0.209 | 0.2 |  |
| 22.8399999999988 | 0.209 | 0.2 |  |
| 22.8199999999988 | 0.209 | 0.2 |  |
| 22.79999999999879 | 0.209 | 0.2 |  |
| 22.77999999999879 | 0.21 | 0.2 |  |
| 22.75999999999879 | 0.21 | 0.2 |  |
| 22.73999999999879 | 0.21 | 0.2 |  |
| 22.71999999999879 | 0.21 | 0.201 |  |
| 22.69999999999879 | 0.21 | 0.201 |  |
| 22.6799999999988 | 0.21 | 0.201 |  |
| 22.6599999999988 | 0.21 | 0.201 |  |
| 22.6399999999988 | 0.21 | 0.201 |  |
| 22.6199999999988 | 0.21 | 0.201 |  |
| 22.5999999999988 | 0.21 | 0.201 |  |
| 22.5799999999988 | 0.21 | 0.201 |  |
| 22.5599999999988 | 0.211 | 0.201 |  |
| 22.5399999999988 | 0.211 | 0.201 |  |
| 22.5199999999988 | 0.211 | 0.201 |  |
| 22.4999999999988 | 0.211 | 0.201 |  |
| 22.4799999999988 | 0.211 | 0.202 |  |
| 22.4599999999988 | 0.211 | 0.202 |  |
| 22.4399999999988 | 0.211 | 0.202 |  |
| 22.4199999999988 | 0.211 | 0.202 |  |
| 22.3999999999988 | 0.211 | 0.202 |  |
| 22.3799999999988 | 0.211 | 0.202 |  |
| 22.3599999999988 | 0.211 | 0.202 |  |
| 22.3399999999988 | 0.212 | 0.202 |  |
| 22.3199999999988 | 0.212 | 0.202 |  |
| 22.2999999999988 | 0.212 | 0.202 |  |
| 22.2799999999988 | 0.212 | 0.202 |  |
| 22.2599999999988 | 0.212 | 0.202 |  |
| 22.2399999999988 | 0.212 | 0.203 |  |
| 22.21999999999881 | 0.212 | 0.203 |  |
| 22.19999999999881 | 0.212 | 0.203 |  |
| 22.17999999999881 | 0.212 | 0.203 |  |
| 22.15999999999881 | 0.212 | 0.203 |  |
| 22.13999999999881 | 0.213 | 0.203 |  |
| 22.11999999999881 | 0.213 | 0.203 |  |
| 22.09999999999881 | 0.213 | 0.203 |  |
| 22.07999999999881 | 0.213 | 0.203 |  |
| 22.05999999999881 | 0.213 | 0.203 |  |
| 22.03999999999881 | 0.213 | 0.203 |  |
| 22.01999999999881 | 0.213 | 0.203 |  |
| 21.99999999999881 | 0.213 | 0.204 |  |
| 21.97999999999881 | 0.213 | 0.204 |  |
| 21.95999999999881 | 0.213 | 0.204 |  |
| 21.93999999999881 | 0.213 | 0.204 |  |
| 21.91999999999881 | 0.214 | 0.204 |  |
| 21.89999999999881 | 0.214 | 0.204 |  |
| 21.87999999999881 | 0.214 | 0.204 |  |
| 21.85999999999881 | 0.214 | 0.204 |  |
| 21.83999999999881 | 0.214 | 0.204 |  |
| 21.81999999999881 | 0.214 | 0.204 |  |
| 21.79999999999881 | 0.214 | 0.204 |  |
| 21.77999999999881 | 0.214 | 0.204 |  |
| 21.75999999999881 | 0.214 | 0.205 |  |
| 21.73999999999882 | 0.214 | 0.205 |  |
| 21.71999999999882 | 0.215 | 0.205 |  |
| 21.69999999999882 | 0.215 | 0.205 |  |
| 21.67999999999882 | 0.215 | 0.205 |  |
| 21.65999999999882 | 0.215 | 0.205 |  |
| 21.63999999999882 | 0.215 | 0.205 |  |
| 21.61999999999882 | 0.215 | 0.205 |  |
| 21.59999999999882 | 0.215 | 0.205 |  |
| 21.57999999999882 | 0.215 | 0.205 |  |
| 21.55999999999882 | 0.215 | 0.205 |  |
| 21.53999999999882 | 0.215 | 0.205 |  |
| 21.51999999999882 | 0.216 | 0.206 |  |
| 21.49999999999882 | 0.216 | 0.206 |  |
| 21.47999999999882 | 0.216 | 0.206 |  |
| 21.45999999999882 | 0.216 | 0.206 |  |
| 21.43999999999882 | 0.216 | 0.206 |  |
| 21.41999999999882 | 0.216 | 0.206 |  |
| 21.39999999999882 | 0.216 | 0.206 |  |
| 21.37999999999882 | 0.216 | 0.206 |  |
| 21.35999999999882 | 0.216 | 0.206 |  |
| 21.33999999999882 | 0.216 | 0.206 |  |
| 21.31999999999882 | 0.217 | 0.206 |  |
| 21.29999999999882 | 0.217 | 0.207 |  |
| 21.27999999999883 | 0.217 | 0.207 |  |
| 21.25999999999883 | 0.217 | 0.207 |  |
| 21.23999999999883 | 0.217 | 0.207 |  |
| 21.21999999999883 | 0.217 | 0.207 |  |
| 21.19999999999883 | 0.217 | 0.207 |  |
| 21.17999999999883 | 0.217 | 0.207 |  |
| 21.15999999999883 | 0.217 | 0.207 |  |
| 21.13999999999883 | 0.217 | 0.207 |  |
| 21.11999999999883 | 0.218 | 0.207 |  |
| 21.09999999999883 | 0.218 | 0.207 |  |
| 21.07999999999883 | 0.218 | 0.207 |  |
| 21.05999999999883 | 0.218 | 0.208 |  |
| 21.03999999999883 | 0.218 | 0.208 |  |
| 21.01999999999883 | 0.218 | 0.208 |  |
| 20.99999999999883 | 0.218 | 0.208 |  |
| 20.97999999999883 | 0.218 | 0.208 |  |
| 20.95999999999883 | 0.218 | 0.208 |  |
| 20.93999999999883 | 0.219 | 0.208 |  |
| 20.91999999999883 | 0.219 | 0.208 |  |
| 20.89999999999883 | 0.219 | 0.208 |  |
| 20.87999999999883 | 0.219 | 0.208 |  |
| 20.85999999999883 | 0.219 | 0.208 |  |
| 20.83999999999883 | 0.219 | 0.209 |  |
| 20.81999999999883 | 0.219 | 0.209 |  |
| 20.79999999999884 | 0.219 | 0.209 |  |
| 20.77999999999884 | 0.219 | 0.209 |  |
| 20.75999999999884 | 0.219 | 0.209 |  |
| 20.73999999999884 | 0.22 | 0.209 |  |
| 20.71999999999884 | 0.22 | 0.209 |  |
| 20.69999999999884 | 0.22 | 0.209 |  |
| 20.67999999999884 | 0.22 | 0.209 |  |
| 20.65999999999884 | 0.22 | 0.209 |  |
| 20.63999999999884 | 0.22 | 0.209 |  |
| 20.61999999999884 | 0.22 | 0.21 |  |
| 20.59999999999884 | 0.22 | 0.21 |  |
| 20.57999999999884 | 0.22 | 0.21 |  |
| 20.55999999999884 | 0.221 | 0.21 |  |
| 20.53999999999884 | 0.221 | 0.21 |  |
| 20.51999999999884 | 0.221 | 0.21 |  |
| 20.49999999999884 | 0.221 | 0.21 |  |
| 20.47999999999884 | 0.221 | 0.21 |  |
| 20.45999999999884 | 0.221 | 0.21 |  |
| 20.43999999999884 | 0.221 | 0.21 |  |
| 20.41999999999884 | 0.221 | 0.21 |  |
| 20.39999999999884 | 0.221 | 0.211 |  |
| 20.37999999999884 | 0.222 | 0.211 |  |
| 20.35999999999884 | 0.222 | 0.211 |  |
| 20.33999999999885 | 0.222 | 0.211 |  |
| 20.31999999999885 | 0.222 | 0.211 |  |
| 20.29999999999885 | 0.222 | 0.211 |  |
| 20.27999999999885 | 0.222 | 0.211 |  |
| 20.25999999999885 | 0.222 | 0.211 |  |
| 20.23999999999885 | 0.222 | 0.211 |  |
| 20.21999999999885 | 0.222 | 0.211 |  |
| 20.19999999999885 | 0.222 | 0.211 |  |
| 20.17999999999885 | 0.223 | 0.212 |  |
| 20.15999999999885 | 0.223 | 0.212 |  |
| 20.13999999999885 | 0.223 | 0.212 |  |
| 20.11999999999885 | 0.223 | 0.212 |  |
| 20.09999999999885 | 0.223 | 0.212 |  |
| 20.07999999999885 | 0.223 | 0.212 |  |
| 20.05999999999885 | 0.223 | 0.212 |  |
| 20.03999999999885 | 0.223 | 0.212 |  |
| 20.01999999999885 | 0.223 | 0.212 |  |
| 19.99999999999885 | 0.224 | 0.212 |  |
| 19.97999999999885 | 0.224 | 0.213 |  |
| 19.95999999999885 | 0.224 | 0.213 |  |
| 19.93999999999885 | 0.224 | 0.213 |  |
| 19.91999999999885 | 0.224 | 0.213 |  |
| 19.89999999999885 | 0.224 | 0.213 |  |
| 19.87999999999885 | 0.224 | 0.213 |  |
| 19.85999999999886 | 0.224 | 0.213 |  |
| 19.83999999999886 | 0.225 | 0.213 |  |
| 19.81999999999886 | 0.225 | 0.213 |  |
| 19.79999999999886 | 0.225 | 0.213 |  |
| 19.77999999999886 | 0.225 | 0.213 |  |
| 19.75999999999886 | 0.225 | 0.214 |  |
| 19.73999999999886 | 0.225 | 0.214 |  |
| 19.71999999999886 | 0.225 | 0.214 |  |
| 19.69999999999886 | 0.225 | 0.214 |  |
| 19.67999999999886 | 0.225 | 0.214 |  |
| 19.65999999999886 | 0.226 | 0.214 |  |
| 19.63999999999886 | 0.226 | 0.214 |  |
| 19.61999999999886 | 0.226 | 0.214 |  |
| 19.59999999999886 | 0.226 | 0.214 |  |
| 19.57999999999886 | 0.226 | 0.214 |  |
| 19.55999999999886 | 0.226 | 0.215 |  |
| 19.53999999999886 | 0.226 | 0.215 |  |
| 19.51999999999886 | 0.226 | 0.215 |  |
| 19.49999999999886 | 0.226 | 0.215 |  |
| 19.47999999999886 | 0.227 | 0.215 |  |
| 19.45999999999886 | 0.227 | 0.215 |  |
| 19.43999999999886 | 0.227 | 0.215 |  |
| 19.41999999999886 | 0.227 | 0.215 |  |
| 19.39999999999887 | 0.227 | 0.215 |  |
| 19.37999999999887 | 0.227 | 0.215 |  |
| 19.35999999999887 | 0.227 | 0.216 |  |
| 19.33999999999887 | 0.227 | 0.216 |  |
| 19.31999999999887 | 0.228 | 0.216 |  |
| 19.29999999999887 | 0.228 | 0.216 |  |
| 19.27999999999887 | 0.228 | 0.216 |  |
| 19.25999999999887 | 0.228 | 0.216 |  |
| 19.23999999999887 | 0.228 | 0.216 |  |
| 19.21999999999887 | 0.228 | 0.216 |  |
| 19.19999999999887 | 0.228 | 0.216 |  |
| 19.17999999999887 | 0.228 | 0.216 |  |
| 19.15999999999887 | 0.228 | 0.217 |  |
| 19.13999999999887 | 0.229 | 0.217 |  |
| 19.11999999999887 | 0.229 | 0.217 |  |
| 19.09999999999887 | 0.229 | 0.217 |  |
| 19.07999999999887 | 0.229 | 0.217 |  |
| 19.05999999999887 | 0.229 | 0.217 |  |
| 19.03999999999887 | 0.229 | 0.217 |  |
| 19.01999999999887 | 0.229 | 0.217 |  |
| 18.99999999999887 | 0.229 | 0.217 |  |
| 18.97999999999887 | 0.23 | 0.217 |  |
| 18.95999999999887 | 0.23 | 0.218 |  |
| 18.93999999999888 | 0.23 | 0.218 |  |
| 18.91999999999888 | 0.23 | 0.218 |  |
| 18.89999999999888 | 0.23 | 0.218 |  |
| 18.87999999999888 | 0.23 | 0.218 |  |
| 18.85999999999888 | 0.23 | 0.218 |  |
| 18.83999999999888 | 0.23 | 0.218 |  |
| 18.81999999999888 | 0.231 | 0.218 |  |
| 18.79999999999888 | 0.231 | 0.218 |  |
| 18.77999999999888 | 0.231 | 0.218 |  |
| 18.75999999999888 | 0.231 | 0.219 |  |
| 18.73999999999888 | 0.231 | 0.219 |  |
| 18.71999999999888 | 0.231 | 0.219 |  |
| 18.69999999999888 | 0.231 | 0.219 |  |
| 18.67999999999888 | 0.231 | 0.219 |  |
| 18.65999999999888 | 0.231 | 0.219 |  |
| 18.63999999999888 | 0.232 | 0.219 |  |
| 18.61999999999888 | 0.232 | 0.219 |  |
| 18.59999999999888 | 0.232 | 0.219 |  |
| 18.57999999999888 | 0.232 | 0.22 |  |
| 18.55999999999888 | 0.232 | 0.22 |  |
| 18.53999999999888 | 0.232 | 0.22 |  |
| 18.51999999999888 | 0.232 | 0.22 |  |
| 18.49999999999888 | 0.232 | 0.22 |  |
| 18.47999999999888 | 0.233 | 0.22 |  |
| 18.45999999999889 | 0.233 | 0.22 |  |
| 18.43999999999889 | 0.233 | 0.22 |  |
| 18.41999999999889 | 0.233 | 0.22 |  |
| 18.39999999999889 | 0.233 | 0.22 |  |
| 18.37999999999889 | 0.233 | 0.221 |  |
| 18.35999999999889 | 0.233 | 0.221 |  |
| 18.33999999999889 | 0.234 | 0.221 |  |
| 18.31999999999889 | 0.234 | 0.221 |  |
| 18.29999999999889 | 0.234 | 0.221 |  |
| 18.27999999999889 | 0.234 | 0.221 |  |
| 18.25999999999889 | 0.234 | 0.221 |  |
| 18.23999999999889 | 0.234 | 0.221 |  |
| 18.2199999999989 | 0.234 | 0.221 |  |
| 18.1999999999989 | 0.234 | 0.222 |  |
| 18.1799999999989 | 0.235 | 0.222 |  |
| 18.1599999999989 | 0.235 | 0.222 |  |
| 18.1399999999989 | 0.235 | 0.222 |  |
| 18.1199999999989 | 0.235 | 0.222 |  |
| 18.09999999999889 | 0.235 | 0.222 |  |
| 18.07999999999889 | 0.235 | 0.222 |  |
| 18.05999999999889 | 0.235 | 0.222 |  |
| 18.03999999999889 | 0.235 | 0.222 |  |
| 18.01999999999889 | 0.236 | 0.222 |  |
| 17.9999999999989 | 0.236 | 0.223 |  |
| 17.9799999999989 | 0.236 | 0.223 |  |
| 17.9599999999989 | 0.236 | 0.223 |  |
| 17.9399999999989 | 0.236 | 0.223 |  |
| 17.9199999999989 | 0.236 | 0.223 |  |
| 17.8999999999989 | 0.236 | 0.223 |  |
| 17.8799999999989 | 0.236 | 0.223 |  |
| 17.8599999999989 | 0.237 | 0.223 |  |
| 17.8399999999989 | 0.237 | 0.223 |  |
| 17.8199999999989 | 0.237 | 0.224 |  |
| 17.7999999999989 | 0.237 | 0.224 |  |
| 17.7799999999989 | 0.237 | 0.224 |  |
| 17.7599999999989 | 0.237 | 0.224 |  |
| 17.7399999999989 | 0.237 | 0.224 |  |
| 17.7199999999989 | 0.238 | 0.224 |  |
| 17.6999999999989 | 0.238 | 0.224 |  |
| 17.6799999999989 | 0.238 | 0.224 |  |
| 17.6599999999989 | 0.238 | 0.224 |  |
| 17.6399999999989 | 0.238 | 0.225 |  |
| 17.6199999999989 | 0.238 | 0.225 |  |
| 17.5999999999989 | 0.238 | 0.225 |  |
| 17.5799999999989 | 0.239 | 0.225 |  |
| 17.5599999999989 | 0.239 | 0.225 |  |
| 17.5399999999989 | 0.239 | 0.225 |  |
| 17.51999999999891 | 0.239 | 0.225 |  |
| 17.49999999999891 | 0.239 | 0.225 |  |
| 17.47999999999891 | 0.239 | 0.225 |  |
| 17.45999999999891 | 0.239 | 0.226 |  |
| 17.43999999999891 | 0.239 | 0.226 |  |
| 17.41999999999891 | 0.24 | 0.226 |  |
| 17.39999999999891 | 0.24 | 0.226 |  |
| 17.37999999999891 | 0.24 | 0.226 |  |
| 17.35999999999891 | 0.24 | 0.226 |  |
| 17.33999999999891 | 0.24 | 0.226 |  |
| 17.31999999999891 | 0.24 | 0.226 |  |
| 17.29999999999891 | 0.24 | 0.227 |  |
| 17.27999999999891 | 0.241 | 0.227 |  |
| 17.25999999999891 | 0.241 | 0.227 |  |
| 17.23999999999891 | 0.241 | 0.227 |  |
| 17.21999999999891 | 0.241 | 0.227 |  |
| 17.19999999999891 | 0.241 | 0.227 |  |
| 17.17999999999891 | 0.241 | 0.227 |  |
| 17.15999999999891 | 0.241 | 0.227 |  |
| 17.13999999999891 | 0.242 | 0.227 |  |
| 17.11999999999891 | 0.242 | 0.228 |  |
| 17.09999999999891 | 0.242 | 0.228 |  |
| 17.07999999999891 | 0.242 | 0.228 |  |
| 17.05999999999892 | 0.242 | 0.228 |  |
| 17.03999999999892 | 0.242 | 0.228 |  |
| 17.01999999999892 | 0.242 | 0.228 |  |
| 16.99999999999892 | 0.243 | 0.228 |  |
| 16.97999999999892 | 0.243 | 0.228 |  |
| 16.95999999999892 | 0.243 | 0.229 |  |
| 16.93999999999892 | 0.243 | 0.229 |  |
| 16.91999999999892 | 0.243 | 0.229 |  |
| 16.89999999999892 | 0.243 | 0.229 |  |
| 16.87999999999892 | 0.243 | 0.229 |  |
| 16.85999999999892 | 0.244 | 0.229 |  |
| 16.83999999999892 | 0.244 | 0.229 |  |
| 16.81999999999892 | 0.244 | 0.229 |  |
| 16.79999999999892 | 0.244 | 0.229 |  |
| 16.77999999999892 | 0.244 | 0.23 |  |
| 16.75999999999892 | 0.244 | 0.23 |  |
| 16.73999999999892 | 0.244 | 0.23 |  |
| 16.71999999999892 | 0.245 | 0.23 |  |
| 16.69999999999892 | 0.245 | 0.23 |  |
| 16.67999999999892 | 0.245 | 0.23 |  |
| 16.65999999999892 | 0.245 | 0.23 |  |
| 16.63999999999892 | 0.245 | 0.23 |  |
| 16.61999999999892 | 0.245 | 0.231 |  |
| 16.59999999999892 | 0.245 | 0.231 |  |
| 16.57999999999893 | 0.246 | 0.231 |  |
| 16.55999999999893 | 0.246 | 0.231 |  |
| 16.53999999999893 | 0.246 | 0.231 |  |
| 16.51999999999893 | 0.246 | 0.231 |  |
| 16.49999999999893 | 0.246 | 0.231 |  |
| 16.47999999999893 | 0.246 | 0.231 |  |
| 16.45999999999893 | 0.246 | 0.232 |  |
| 16.43999999999893 | 0.247 | 0.232 |  |
| 16.41999999999893 | 0.247 | 0.232 |  |
| 16.39999999999893 | 0.247 | 0.232 |  |
| 16.37999999999893 | 0.247 | 0.232 |  |
| 16.35999999999893 | 0.247 | 0.232 |  |
| 16.33999999999893 | 0.247 | 0.232 |  |
| 16.31999999999893 | 0.248 | 0.232 |  |
| 16.29999999999893 | 0.248 | 0.232 |  |
| 16.27999999999893 | 0.248 | 0.233 |  |
| 16.25999999999893 | 0.248 | 0.233 |  |
| 16.23999999999893 | 0.248 | 0.233 |  |
| 16.21999999999893 | 0.248 | 0.233 |  |
| 16.19999999999893 | 0.248 | 0.233 |  |
| 16.17999999999893 | 0.249 | 0.233 |  |
| 16.15999999999893 | 0.249 | 0.233 |  |
| 16.13999999999893 | 0.249 | 0.233 |  |
| 16.11999999999894 | 0.249 | 0.234 |  |
| 16.09999999999894 | 0.249 | 0.234 |  |
| 16.07999999999894 | 0.249 | 0.234 |  |
| 16.05999999999894 | 0.25 | 0.234 |  |
| 16.03999999999894 | 0.25 | 0.234 |  |
| 16.01999999999894 | 0.25 | 0.234 |  |
| 15.99999999999894 | 0.25 | 0.234 |  |
| 15.97999999999894 | 0.25 | 0.235 |  |
| 15.95999999999894 | 0.25 | 0.235 |  |
| 15.93999999999894 | 0.25 | 0.235 |  |
| 15.91999999999894 | 0.251 | 0.235 |  |
| 15.89999999999894 | 0.251 | 0.235 |  |
| 15.87999999999894 | 0.251 | 0.235 |  |
| 15.85999999999894 | 0.251 | 0.235 |  |
| 15.83999999999894 | 0.251 | 0.235 |  |
| 15.81999999999894 | 0.251 | 0.236 |  |
| 15.79999999999894 | 0.252 | 0.236 |  |
| 15.77999999999894 | 0.252 | 0.236 |  |
| 15.75999999999894 | 0.252 | 0.236 |  |
| 15.73999999999894 | 0.252 | 0.236 |  |
| 15.71999999999894 | 0.252 | 0.236 |  |
| 15.69999999999894 | 0.252 | 0.236 |  |
| 15.67999999999894 | 0.253 | 0.236 |  |
| 15.65999999999894 | 0.253 | 0.237 |  |
| 15.63999999999895 | 0.253 | 0.237 |  |
| 15.61999999999895 | 0.253 | 0.237 |  |
| 15.59999999999895 | 0.253 | 0.237 |  |
| 15.57999999999895 | 0.253 | 0.237 |  |
| 15.55999999999895 | 0.254 | 0.237 |  |
| 15.53999999999895 | 0.254 | 0.237 |  |
| 15.51999999999895 | 0.254 | 0.237 |  |
| 15.49999999999895 | 0.254 | 0.238 |  |
| 15.47999999999895 | 0.254 | 0.238 |  |
| 15.45999999999895 | 0.254 | 0.238 |  |
| 15.43999999999895 | 0.254 | 0.238 |  |
| 15.41999999999895 | 0.255 | 0.238 |  |
| 15.39999999999895 | 0.255 | 0.238 |  |
| 15.37999999999895 | 0.255 | 0.238 |  |
| 15.35999999999895 | 0.255 | 0.239 |  |
| 15.33999999999895 | 0.255 | 0.239 |  |
| 15.31999999999895 | 0.255 | 0.239 |  |
| 15.29999999999895 | 0.256 | 0.239 |  |
| 15.27999999999895 | 0.256 | 0.239 |  |
| 15.25999999999895 | 0.256 | 0.239 |  |
| 15.23999999999895 | 0.256 | 0.239 |  |
| 15.21999999999895 | 0.256 | 0.239 |  |
| 15.19999999999895 | 0.256 | 0.24 |  |
| 15.17999999999896 | 0.257 | 0.24 |  |
| 15.15999999999896 | 0.257 | 0.24 |  |
| 15.13999999999896 | 0.257 | 0.24 |  |
| 15.11999999999896 | 0.257 | 0.24 |  |
| 15.09999999999896 | 0.257 | 0.24 |  |
| 15.07999999999896 | 0.258 | 0.24 |  |
| 15.05999999999896 | 0.258 | 0.241 |  |
| 15.03999999999896 | 0.258 | 0.241 |  |
| 15.01999999999896 | 0.258 | 0.241 |  |
| 14.99999999999896 | 0.258 | 0.241 |  |
| 14.97999999999896 | 0.258 | 0.241 |  |
| 14.95999999999896 | 0.259 | 0.241 |  |
| 14.93999999999896 | 0.259 | 0.241 |  |
| 14.91999999999896 | 0.259 | 0.242 |  |
| 14.89999999999896 | 0.259 | 0.242 |  |
| 14.87999999999896 | 0.259 | 0.242 |  |
| 14.85999999999896 | 0.259 | 0.242 |  |
| 14.83999999999896 | 0.26 | 0.242 |  |
| 14.81999999999896 | 0.26 | 0.242 |  |
| 14.79999999999896 | 0.26 | 0.242 |  |
| 14.77999999999896 | 0.26 | 0.243 |  |
| 14.75999999999896 | 0.26 | 0.243 |  |
| 14.73999999999896 | 0.26 | 0.243 |  |
| 14.71999999999896 | 0.261 | 0.243 |  |
| 14.69999999999897 | 0.261 | 0.243 |  |
| 14.67999999999897 | 0.261 | 0.243 |  |
| 14.65999999999897 | 0.261 | 0.243 |  |
| 14.63999999999897 | 0.261 | 0.244 |  |
| 14.61999999999897 | 0.262 | 0.244 |  |
| 14.59999999999897 | 0.262 | 0.244 |  |
| 14.57999999999897 | 0.262 | 0.244 |  |
| 14.55999999999897 | 0.262 | 0.244 |  |
| 14.53999999999897 | 0.262 | 0.244 |  |
| 14.51999999999897 | 0.262 | 0.244 |  |
| 14.49999999999897 | 0.263 | 0.245 |  |
| 14.47999999999897 | 0.263 | 0.245 |  |
| 14.45999999999897 | 0.263 | 0.245 |  |
| 14.43999999999897 | 0.263 | 0.245 |  |
| 14.41999999999897 | 0.263 | 0.245 |  |
| 14.39999999999897 | 0.264 | 0.245 |  |
| 14.37999999999897 | 0.264 | 0.245 |  |
| 14.35999999999897 | 0.264 | 0.246 |  |
| 14.33999999999897 | 0.264 | 0.246 |  |
| 14.31999999999897 | 0.264 | 0.246 |  |
| 14.29999999999897 | 0.264 | 0.246 |  |
| 14.27999999999897 | 0.265 | 0.246 |  |
| 14.25999999999897 | 0.265 | 0.246 |  |
| 14.23999999999898 | 0.265 | 0.246 |  |
| 14.21999999999898 | 0.265 | 0.247 |  |
| 14.19999999999898 | 0.265 | 0.247 |  |
| 14.17999999999898 | 0.266 | 0.247 |  |
| 14.15999999999898 | 0.266 | 0.247 |  |
| 14.13999999999898 | 0.266 | 0.247 |  |
| 14.11999999999898 | 0.266 | 0.247 |  |
| 14.09999999999898 | 0.266 | 0.247 |  |
| 14.07999999999898 | 0.267 | 0.248 |  |
| 14.05999999999898 | 0.267 | 0.248 |  |
| 14.03999999999898 | 0.267 | 0.248 |  |
| 14.01999999999898 | 0.267 | 0.248 |  |
| 13.99999999999898 | 0.267 | 0.248 |  |
| 13.97999999999898 | 0.267 | 0.248 |  |
| 13.95999999999898 | 0.268 | 0.248 |  |
| 13.93999999999898 | 0.268 | 0.249 |  |
| 13.91999999999898 | 0.268 | 0.249 |  |
| 13.89999999999898 | 0.268 | 0.249 |  |
| 13.87999999999898 | 0.268 | 0.249 |  |
| 13.85999999999898 | 0.269 | 0.249 |  |
| 13.83999999999898 | 0.269 | 0.249 |  |
| 13.81999999999898 | 0.269 | 0.25 |  |
| 13.79999999999898 | 0.269 | 0.25 |  |
| 13.77999999999898 | 0.269 | 0.25 |  |
| 13.75999999999899 | 0.27 | 0.25 |  |
| 13.73999999999899 | 0.27 | 0.25 |  |
| 13.71999999999899 | 0.27 | 0.25 |  |
| 13.69999999999899 | 0.27 | 0.25 |  |
| 13.67999999999899 | 0.27 | 0.251 |  |
| 13.65999999999899 | 0.271 | 0.251 |  |
| 13.63999999999899 | 0.271 | 0.251 |  |
| 13.61999999999899 | 0.271 | 0.251 |  |
| 13.59999999999899 | 0.271 | 0.251 |  |
| 13.57999999999899 | 0.271 | 0.251 |  |
| 13.55999999999899 | 0.272 | 0.252 |  |
| 13.539999999999 | 0.272 | 0.252 |  |
| 13.519999999999 | 0.272 | 0.252 |  |
| 13.499999999999 | 0.272 | 0.252 |  |
| 13.479999999999 | 0.272 | 0.252 |  |
| 13.459999999999 | 0.273 | 0.252 |  |
| 13.439999999999 | 0.273 | 0.252 |  |
| 13.419999999999 | 0.273 | 0.253 |  |
| 13.399999999999 | 0.273 | 0.253 |  |
| 13.379999999999 | 0.273 | 0.253 |  |
| 13.359999999999 | 0.274 | 0.253 |  |
| 13.33999999999899 | 0.274 | 0.253 |  |
| 13.31999999999899 | 0.274 | 0.253 |  |
| 13.299999999999 | 0.274 | 0.254 |  |
| 13.279999999999 | 0.274 | 0.254 |  |
| 13.259999999999 | 0.275 | 0.254 |  |
| 13.239999999999 | 0.275 | 0.254 |  |
| 13.219999999999 | 0.275 | 0.254 |  |
| 13.199999999999 | 0.275 | 0.254 |  |
| 13.179999999999 | 0.275 | 0.255 |  |
| 13.159999999999 | 0.276 | 0.255 |  |
| 13.139999999999 | 0.276 | 0.255 |  |
| 13.119999999999 | 0.276 | 0.255 |  |
| 13.099999999999 | 0.276 | 0.255 |  |
| 13.079999999999 | 0.277 | 0.255 |  |
| 13.059999999999 | 0.277 | 0.256 |  |
| 13.039999999999 | 0.277 | 0.256 |  |
| 13.019999999999 | 0.277 | 0.256 |  |
| 12.999999999999 | 0.277 | 0.256 |  |
| 12.979999999999 | 0.278 | 0.256 |  |
| 12.959999999999 | 0.278 | 0.256 |  |
| 12.939999999999 | 0.278 | 0.257 |  |
| 12.919999999999 | 0.278 | 0.257 |  |
| 12.899999999999 | 0.278 | 0.257 |  |
| 12.879999999999 | 0.279 | 0.257 |  |
| 12.859999999999 | 0.279 | 0.257 |  |
| 12.83999999999901 | 0.279 | 0.257 |  |
| 12.81999999999901 | 0.279 | 0.258 |  |
| 12.79999999999901 | 0.28 | 0.258 |  |
| 12.77999999999901 | 0.28 | 0.258 |  |
| 12.75999999999901 | 0.28 | 0.258 |  |
| 12.73999999999901 | 0.28 | 0.258 |  |
| 12.71999999999901 | 0.28 | 0.258 |  |
| 12.69999999999901 | 0.281 | 0.259 |  |
| 12.67999999999901 | 0.281 | 0.259 |  |
| 12.65999999999901 | 0.281 | 0.259 |  |
| 12.63999999999901 | 0.281 | 0.259 |  |
| 12.61999999999901 | 0.281 | 0.259 |  |
| 12.59999999999901 | 0.282 | 0.259 |  |
| 12.57999999999901 | 0.282 | 0.26 |  |
| 12.55999999999901 | 0.282 | 0.26 |  |
| 12.53999999999901 | 0.282 | 0.26 |  |
| 12.51999999999901 | 0.283 | 0.26 |  |
| 12.49999999999901 | 0.283 | 0.26 |  |
| 12.47999999999901 | 0.283 | 0.26 |  |
| 12.45999999999901 | 0.283 | 0.261 |  |
| 12.43999999999901 | 0.284 | 0.261 |  |
| 12.41999999999901 | 0.284 | 0.261 |  |
| 12.39999999999901 | 0.284 | 0.261 |  |
| 12.37999999999901 | 0.284 | 0.261 |  |
| 12.35999999999902 | 0.284 | 0.261 |  |
| 12.33999999999902 | 0.285 | 0.262 |  |
| 12.31999999999902 | 0.285 | 0.262 |  |
| 12.29999999999902 | 0.285 | 0.262 |  |
| 12.27999999999902 | 0.285 | 0.262 |  |
| 12.25999999999902 | 0.286 | 0.262 |  |
| 12.23999999999902 | 0.286 | 0.262 |  |
| 12.21999999999902 | 0.286 | 0.263 |  |
| 12.19999999999902 | 0.286 | 0.263 |  |
| 12.17999999999902 | 0.287 | 0.263 |  |
| 12.15999999999902 | 0.287 | 0.263 |  |
| 12.13999999999902 | 0.287 | 0.263 |  |
| 12.11999999999902 | 0.287 | 0.264 |  |
| 12.09999999999902 | 0.287 | 0.264 |  |
| 12.07999999999902 | 0.288 | 0.264 |  |
| 12.05999999999902 | 0.288 | 0.264 |  |
| 12.03999999999902 | 0.288 | 0.264 |  |
| 12.01999999999902 | 0.288 | 0.264 |  |
| 11.99999999999902 | 0.289 | 0.265 |  |
| 11.97999999999902 | 0.289 | 0.265 |  |
| 11.95999999999902 | 0.289 | 0.265 |  |
| 11.93999999999902 | 0.289 | 0.265 |  |
| 11.91999999999902 | 0.29 | 0.265 |  |
| 11.89999999999903 | 0.29 | 0.266 |  |
| 11.87999999999903 | 0.29 | 0.266 |  |
| 11.85999999999903 | 0.29 | 0.266 |  |
| 11.83999999999903 | 0.291 | 0.266 |  |
| 11.81999999999903 | 0.291 | 0.266 |  |
| 11.79999999999903 | 0.291 | 0.266 |  |
| 11.77999999999903 | 0.291 | 0.267 |  |
| 11.75999999999903 | 0.292 | 0.267 |  |
| 11.73999999999903 | 0.292 | 0.267 |  |
| 11.71999999999903 | 0.292 | 0.267 |  |
| 11.69999999999903 | 0.292 | 0.267 |  |
| 11.67999999999903 | 0.293 | 0.268 |  |
| 11.65999999999903 | 0.293 | 0.268 |  |
| 11.63999999999903 | 0.293 | 0.268 |  |
| 11.61999999999903 | 0.293 | 0.268 |  |
| 11.59999999999903 | 0.294 | 0.268 |  |
| 11.57999999999903 | 0.294 | 0.268 |  |
| 11.55999999999903 | 0.294 | 0.269 |  |
| 11.53999999999903 | 0.294 | 0.269 |  |
| 11.51999999999903 | 0.295 | 0.269 |  |
| 11.49999999999903 | 0.295 | 0.269 |  |
| 11.47999999999903 | 0.295 | 0.269 |  |
| 11.45999999999903 | 0.295 | 0.27 |  |
| 11.43999999999903 | 0.296 | 0.27 |  |
| 11.41999999999904 | 0.296 | 0.27 |  |
| 11.39999999999904 | 0.296 | 0.27 |  |
| 11.37999999999904 | 0.296 | 0.27 |  |
| 11.35999999999904 | 0.297 | 0.271 |  |
| 11.33999999999904 | 0.297 | 0.271 |  |
| 11.31999999999904 | 0.297 | 0.271 |  |
| 11.29999999999904 | 0.297 | 0.271 |  |
| 11.27999999999904 | 0.298 | 0.271 |  |
| 11.25999999999904 | 0.298 | 0.272 |  |
| 11.23999999999904 | 0.298 | 0.272 |  |
| 11.21999999999904 | 0.299 | 0.272 |  |
| 11.19999999999904 | 0.299 | 0.272 |  |
| 11.17999999999904 | 0.299 | 0.272 |  |
| 11.15999999999904 | 0.299 | 0.273 |  |
| 11.13999999999904 | 0.3 | 0.273 |  |
| 11.11999999999904 | 0.3 | 0.273 |  |
| 11.09999999999904 | 0.3 | 0.273 |  |
| 11.07999999999904 | 0.3 | 0.273 |  |
| 11.05999999999904 | 0.301 | 0.274 |  |
| 11.03999999999904 | 0.301 | 0.274 |  |
| 11.01999999999904 | 0.301 | 0.274 |  |
| 10.99999999999904 | 0.302 | 0.274 |  |
| 10.97999999999904 | 0.302 | 0.274 |  |
| 10.95999999999905 | 0.302 | 0.275 |  |
| 10.93999999999905 | 0.302 | 0.275 |  |
| 10.91999999999905 | 0.303 | 0.275 |  |
| 10.89999999999905 | 0.303 | 0.275 |  |
| 10.87999999999905 | 0.303 | 0.275 |  |
| 10.85999999999905 | 0.303 | 0.276 |  |
| 10.83999999999905 | 0.304 | 0.276 |  |
| 10.81999999999905 | 0.304 | 0.276 |  |
| 10.79999999999905 | 0.304 | 0.276 |  |
| 10.77999999999905 | 0.305 | 0.276 |  |
| 10.75999999999905 | 0.305 | 0.277 |  |
| 10.73999999999905 | 0.305 | 0.277 |  |
| 10.71999999999905 | 0.305 | 0.277 |  |
| 10.69999999999905 | 0.306 | 0.277 |  |
| 10.67999999999905 | 0.306 | 0.277 |  |
| 10.65999999999905 | 0.306 | 0.278 |  |
| 10.63999999999905 | 0.307 | 0.278 |  |
| 10.61999999999905 | 0.307 | 0.278 |  |
| 10.59999999999905 | 0.307 | 0.278 |  |
| 10.57999999999905 | 0.307 | 0.278 |  |
| 10.55999999999905 | 0.308 | 0.279 |  |
| 10.53999999999905 | 0.308 | 0.279 |  |
| 10.51999999999905 | 0.308 | 0.279 |  |
| 10.49999999999905 | 0.309 | 0.279 |  |
| 10.47999999999906 | 0.309 | 0.279 |  |
| 10.45999999999906 | 0.309 | 0.28 |  |
| 10.43999999999906 | 0.309 | 0.28 |  |
| 10.41999999999906 | 0.31 | 0.28 |  |
| 10.39999999999906 | 0.31 | 0.28 |  |
| 10.37999999999906 | 0.31 | 0.28 |  |
| 10.35999999999906 | 0.311 | 0.281 |  |
| 10.33999999999906 | 0.311 | 0.281 |  |
| 10.31999999999906 | 0.311 | 0.281 |  |
| 10.29999999999906 | 0.312 | 0.281 |  |
| 10.27999999999906 | 0.312 | 0.282 |  |
| 10.25999999999906 | 0.312 | 0.282 |  |
| 10.23999999999906 | 0.313 | 0.282 |  |
| 10.21999999999906 | 0.313 | 0.282 |  |
| 10.19999999999906 | 0.313 | 0.282 |  |
| 10.17999999999906 | 0.313 | 0.283 |  |
| 10.15999999999906 | 0.314 | 0.283 |  |
| 10.13999999999906 | 0.314 | 0.283 |  |
| 10.11999999999906 | 0.314 | 0.283 |  |
| 10.09999999999906 | 0.315 | 0.284 |  |
| 10.07999999999906 | 0.315 | 0.284 |  |
| 10.05999999999906 | 0.315 | 0.284 |  |
| 10.03999999999906 | 0.316 | 0.284 |  |
| 10.01999999999907 | 0.316 | 0.284 |  |
| 9.999999999999066 | 0.316 | 0.285 |  |
| 9.979999999999066 | 0.317 | 0.285 |  |
| 9.959999999999066 | 0.317 | 0.285 |  |
| 9.939999999999065 | 0.317 | 0.285 |  |
| 9.919999999999067 | 0.318 | 0.285 |  |
| 9.899999999999068 | 0.318 | 0.286 |  |
| 9.879999999999068 | 0.318 | 0.286 |  |
| 9.859999999999069 | 0.318 | 0.286 |  |
| 9.839999999999067 | 0.319 | 0.286 |  |
| 9.81999999999907 | 0.319 | 0.287 |  |
| 9.79999999999907 | 0.319 | 0.287 |  |
| 9.77999999999907 | 0.32 | 0.287 |  |
| 9.75999999999907 | 0.32 | 0.287 |  |
| 9.739999999999071 | 0.32 | 0.288 |  |
| 9.719999999999072 | 0.321 | 0.288 |  |
| 9.69999999999907 | 0.321 | 0.288 |  |
| 9.679999999999072 | 0.321 | 0.288 |  |
| 9.659999999999073 | 0.322 | 0.288 |  |
| 9.639999999999073 | 0.322 | 0.289 |  |
| 9.619999999999074 | 0.322 | 0.289 |  |
| 9.599999999999074 | 0.323 | 0.289 |  |
| 9.579999999999075 | 0.323 | 0.289 |  |
| 9.559999999999075 | 0.323 | 0.29 |  |
| 9.539999999999075 | 0.324 | 0.29 |  |
| 9.519999999999076 | 0.324 | 0.29 |  |
| 9.499999999999076 | 0.324 | 0.29 |  |
| 9.479999999999077 | 0.325 | 0.291 |  |
| 9.459999999999077 | 0.325 | 0.291 |  |
| 9.439999999999078 | 0.325 | 0.291 |  |
| 9.419999999999076 | 0.326 | 0.291 |  |
| 9.399999999999078 | 0.326 | 0.291 |  |
| 9.379999999999079 | 0.327 | 0.292 |  |
| 9.35999999999908 | 0.327 | 0.292 |  |
| 9.33999999999908 | 0.327 | 0.292 |  |
| 9.31999999999908 | 0.328 | 0.292 |  |
| 9.29999999999908 | 0.328 | 0.293 |  |
| 9.27999999999908 | 0.328 | 0.293 |  |
| 9.25999999999908 | 0.329 | 0.293 |  |
| 9.239999999999082 | 0.329 | 0.293 |  |
| 9.219999999999082 | 0.329 | 0.294 |  |
| 9.199999999999083 | 0.33 | 0.294 |  |
| 9.179999999999083 | 0.33 | 0.294 |  |
| 9.159999999999084 | 0.33 | 0.294 |  |
| 9.139999999999082 | 0.331 | 0.295 |  |
| 9.119999999999084 | 0.331 | 0.295 |  |
| 9.099999999999085 | 0.331 | 0.295 |  |
| 9.079999999999085 | 0.332 | 0.295 |  |
| 9.059999999999086 | 0.332 | 0.296 |  |
| 9.039999999999086 | 0.333 | 0.296 |  |
| 9.019999999999087 | 0.333 | 0.296 |  |
| 8.999999999999085 | 0.333 | 0.296 |  |
| 8.979999999999087 | 0.334 | 0.297 |  |
| 8.959999999999088 | 0.334 | 0.297 |  |
| 8.939999999999088 | 0.334 | 0.297 |  |
| 8.919999999999089 | 0.335 | 0.297 |  |
| 8.89999999999909 | 0.335 | 0.298 |  |
| 8.87999999999909 | 0.336 | 0.298 |  |
| 8.85999999999909 | 0.336 | 0.298 |  |
| 8.83999999999909 | 0.336 | 0.298 |  |
| 8.81999999999909 | 0.337 | 0.299 |  |
| 8.79999999999909 | 0.337 | 0.299 |  |
| 8.77999999999909 | 0.337 | 0.299 |  |
| 8.75999999999909 | 0.338 | 0.299 |  |
| 8.739999999999092 | 0.338 | 0.3 |  |
| 8.719999999999091 | 0.339 | 0.3 |  |
| 8.699999999999093 | 0.339 | 0.3 |  |
| 8.679999999999094 | 0.339 | 0.3 |  |
| 8.659999999999094 | 0.34 | 0.301 |  |
| 8.639999999999095 | 0.34 | 0.301 |  |
| 8.619999999999093 | 0.341 | 0.301 |  |
| 8.599999999999095 | 0.341 | 0.301 |  |
| 8.579999999999094 | 0.341 | 0.302 |  |
| 8.559999999999096 | 0.342 | 0.302 |  |
| 8.539999999999097 | 0.342 | 0.302 |  |
| 8.519999999999097 | 0.343 | 0.302 |  |
| 8.499999999999098 | 0.343 | 0.303 |  |
| 8.479999999999098 | 0.343 | 0.303 |  |
| 8.459999999999098 | 0.344 | 0.303 |  |
| 8.439999999999097 | 0.344 | 0.303 |  |
| 8.4199999999991 | 0.345 | 0.304 |  |
| 8.3999999999991 | 0.345 | 0.304 |  |
| 8.3799999999991 | 0.345 | 0.304 |  |
| 8.3599999999991 | 0.346 | 0.304 |  |
| 8.3399999999991 | 0.346 | 0.305 |  |
| 8.3199999999991 | 0.347 | 0.305 |  |
| 8.299999999999102 | 0.347 | 0.305 |  |
| 8.279999999999102 | 0.348 | 0.306 |  |
| 8.259999999999103 | 0.348 | 0.306 |  |
| 8.239999999999103 | 0.348 | 0.306 |  |
| 8.219999999999104 | 0.349 | 0.306 |  |
| 8.199999999999102 | 0.349 | 0.307 |  |
| 8.179999999999104 | 0.35 | 0.307 |  |
| 8.159999999999105 | 0.35 | 0.307 |  |
| 8.139999999999105 | 0.35 | 0.307 |  |
| 8.119999999999106 | 0.351 | 0.308 |  |
| 8.099999999999106 | 0.351 | 0.308 |  |
| 8.079999999999107 | 0.352 | 0.308 |  |
| 8.059999999999105 | 0.352 | 0.309 |  |
| 8.039999999999107 | 0.353 | 0.309 |  |
| 8.019999999999108 | 0.353 | 0.309 |  |
| 7.999999999999108 | 0.354 | 0.309 |  |
| 7.979999999999108 | 0.354 | 0.31 |  |
| 7.95999999999911 | 0.354 | 0.31 |  |
| 7.93999999999911 | 0.355 | 0.31 |  |
| 7.91999999999911 | 0.355 | 0.31 |  |
| 7.89999999999911 | 0.356 | 0.311 |  |
| 7.87999999999911 | 0.356 | 0.311 |  |
| 7.859999999999111 | 0.357 | 0.311 |  |
| 7.839999999999111 | 0.357 | 0.312 |  |
| 7.819999999999112 | 0.358 | 0.312 |  |
| 7.799999999999112 | 0.358 | 0.312 |  |
| 7.779999999999112 | 0.359 | 0.312 |  |
| 7.759999999999113 | 0.359 | 0.313 |  |
| 7.739999999999113 | 0.359 | 0.313 |  |
| 7.719999999999114 | 0.36 | 0.313 |  |
| 7.699999999999114 | 0.36 | 0.314 |  |
| 7.679999999999114 | 0.361 | 0.314 |  |
| 7.659999999999115 | 0.361 | 0.314 |  |
| 7.639999999999115 | 0.362 | 0.314 |  |
| 7.619999999999116 | 0.362 | 0.315 |  |
| 7.599999999999116 | 0.363 | 0.315 |  |
| 7.579999999999117 | 0.363 | 0.315 |  |
| 7.559999999999117 | 0.364 | 0.316 |  |
| 7.539999999999118 | 0.364 | 0.316 |  |
| 7.519999999999118 | 0.365 | 0.316 |  |
| 7.499999999999118 | 0.365 | 0.316 |  |
| 7.47999999999912 | 0.366 | 0.317 |  |
| 7.45999999999912 | 0.366 | 0.317 |  |
| 7.43999999999912 | 0.367 | 0.317 |  |
| 7.41999999999912 | 0.367 | 0.318 |  |
| 7.39999999999912 | 0.368 | 0.318 |  |
| 7.37999999999912 | 0.368 | 0.318 |  |
| 7.359999999999121 | 0.369 | 0.319 |  |
| 7.339999999999122 | 0.369 | 0.319 |  |
| 7.319999999999122 | 0.37 | 0.319 |  |
| 7.299999999999123 | 0.37 | 0.319 |  |
| 7.279999999999123 | 0.371 | 0.32 |  |
| 7.259999999999124 | 0.371 | 0.32 |  |
| 7.239999999999124 | 0.372 | 0.32 |  |
| 7.219999999999124 | 0.372 | 0.321 |  |
| 7.199999999999125 | 0.373 | 0.321 |  |
| 7.179999999999125 | 0.373 | 0.321 |  |
| 7.159999999999126 | 0.374 | 0.322 |  |
| 7.139999999999126 | 0.374 | 0.322 |  |
| 7.119999999999127 | 0.375 | 0.322 |  |
| 7.099999999999127 | 0.375 | 0.322 |  |
| 7.079999999999127 | 0.376 | 0.323 |  |
| 7.059999999999128 | 0.376 | 0.323 |  |
| 7.039999999999128 | 0.377 | 0.323 |  |
| 7.01999999999913 | 0.377 | 0.324 |  |
| 6.99999999999913 | 0.378 | 0.324 |  |
| 6.97999999999913 | 0.379 | 0.324 |  |
| 6.95999999999913 | 0.379 | 0.325 |  |
| 6.93999999999913 | 0.38 | 0.325 |  |
| 6.91999999999913 | 0.38 | 0.325 |  |
| 6.899999999999131 | 0.381 | 0.326 |  |
| 6.879999999999132 | 0.381 | 0.326 |  |
| 6.859999999999132 | 0.382 | 0.326 |  |
| 6.839999999999132 | 0.382 | 0.326 |  |
| 6.819999999999133 | 0.383 | 0.327 |  |
| 6.799999999999133 | 0.383 | 0.327 |  |
| 6.779999999999134 | 0.384 | 0.327 |  |
| 6.759999999999134 | 0.385 | 0.328 |  |
| 6.739999999999135 | 0.385 | 0.328 |  |
| 6.719999999999135 | 0.386 | 0.328 |  |
| 6.699999999999135 | 0.386 | 0.329 |  |
| 6.679999999999136 | 0.387 | 0.329 |  |
| 6.659999999999136 | 0.387 | 0.329 |  |
| 6.639999999999137 | 0.388 | 0.33 |  |
| 6.619999999999137 | 0.389 | 0.33 |  |
| 6.599999999999138 | 0.389 | 0.33 |  |
| 6.579999999999138 | 0.39 | 0.331 |  |
| 6.559999999999138 | 0.39 | 0.331 |  |
| 6.53999999999914 | 0.391 | 0.331 |  |
| 6.51999999999914 | 0.392 | 0.332 |  |
| 6.49999999999914 | 0.392 | 0.332 |  |
| 6.47999999999914 | 0.393 | 0.332 |  |
| 6.45999999999914 | 0.393 | 0.333 |  |
| 6.43999999999914 | 0.394 | 0.333 |  |
| 6.419999999999141 | 0.395 | 0.333 |  |
| 6.399999999999142 | 0.395 | 0.334 |  |
| 6.379999999999142 | 0.396 | 0.334 |  |
| 6.359999999999143 | 0.397 | 0.334 |  |
| 6.339999999999143 | 0.397 | 0.335 |  |
| 6.319999999999144 | 0.398 | 0.335 |  |
| 6.299999999999144 | 0.398 | 0.335 |  |
| 6.279999999999144 | 0.399 | 0.336 |  |
| 6.259999999999145 | 0.4 | 0.336 |  |
| 6.239999999999145 | 0.4 | 0.336 |  |
| 6.219999999999146 | 0.401 | 0.336 |  |
| 6.199999999999146 | 0.402 | 0.337 |  |
| 6.179999999999147 | 0.402 | 0.337 |  |
| 6.159999999999147 | 0.403 | 0.338 |  |
| 6.139999999999147 | 0.404 | 0.338 |  |
| 6.119999999999148 | 0.404 | 0.338 |  |
| 6.099999999999148 | 0.405 | 0.339 |  |
| 6.07999999999915 | 0.406 | 0.339 |  |
| 6.05999999999915 | 0.406 | 0.339 |  |
| 6.03999999999915 | 0.407 | 0.34 |  |
| 6.01999999999915 | 0.408 | 0.34 |  |
| 5.99999999999915 | 0.408 | 0.34 |  |
| 5.97999999999915 | 0.409 | 0.341 |  |
| 5.959999999999151 | 0.41 | 0.341 |  |
| 5.939999999999152 | 0.41 | 0.341 |  |
| 5.919999999999152 | 0.411 | 0.342 |  |
| 5.899999999999153 | 0.412 | 0.342 |  |
| 5.879999999999153 | 0.412 | 0.342 |  |
| 5.859999999999154 | 0.413 | 0.343 |  |
| 5.839999999999154 | 0.414 | 0.343 |  |
| 5.819999999999154 | 0.415 | 0.343 |  |
| 5.799999999999155 | 0.415 | 0.344 |  |
| 5.779999999999155 | 0.416 | 0.344 |  |
| 5.759999999999155 | 0.417 | 0.344 |  |
| 5.739999999999156 | 0.417 | 0.345 |  |
| 5.719999999999156 | 0.418 | 0.345 |  |
| 5.699999999999157 | 0.419 | 0.345 |  |
| 5.679999999999157 | 0.42 | 0.346 |  |
| 5.659999999999158 | 0.42 | 0.346 |  |
| 5.639999999999158 | 0.421 | 0.346 |  |
| 5.619999999999159 | 0.422 | 0.347 |  |
| 5.59999999999916 | 0.423 | 0.347 |  |
| 5.57999999999916 | 0.423 | 0.347 |  |
| 5.55999999999916 | 0.424 | 0.348 |  |
| 5.53999999999916 | 0.425 | 0.348 |  |
| 5.51999999999916 | 0.426 | 0.349 |  |
| 5.49999999999916 | 0.426 | 0.349 |  |
| 5.47999999999916 | 0.427 | 0.349 |  |
| 5.459999999999162 | 0.428 | 0.35 |  |
| 5.439999999999162 | 0.429 | 0.35 |  |
| 5.419999999999163 | 0.43 | 0.35 |  |
| 5.399999999999163 | 0.43 | 0.351 |  |
| 5.379999999999164 | 0.431 | 0.351 |  |
| 5.359999999999164 | 0.432 | 0.351 |  |
| 5.339999999999164 | 0.433 | 0.352 |  |
| 5.319999999999165 | 0.434 | 0.352 |  |
| 5.299999999999165 | 0.434 | 0.352 |  |
| 5.279999999999166 | 0.435 | 0.353 |  |
| 5.259999999999166 | 0.436 | 0.353 |  |
| 5.239999999999167 | 0.437 | 0.353 |  |
| 5.219999999999167 | 0.438 | 0.354 |  |
| 5.199999999999167 | 0.439 | 0.354 |  |
| 5.179999999999168 | 0.439 | 0.355 |  |
| 5.159999999999168 | 0.44 | 0.355 |  |
| 5.13999999999917 | 0.441 | 0.355 |  |
| 5.11999999999917 | 0.442 | 0.356 |  |
| 5.09999999999917 | 0.443 | 0.356 |  |
| 5.07999999999917 | 0.444 | 0.356 |  |
| 5.05999999999917 | 0.445 | 0.357 |  |
| 5.03999999999917 | 0.445 | 0.357 |  |
| 5.019999999999171 | 0.446 | 0.357 |  |
| 4.999999999999172 | 0.447 | 0.358 |  |
| 4.979999999999172 | 0.448 | 0.358 |  |
| 4.959999999999173 | 0.449 | 0.358 |  |
| 4.939999999999173 | 0.45 | 0.359 |  |
| 4.919999999999173 | 0.451 | 0.359 |  |
| 4.899999999999174 | 0.452 | 0.36 |  |
| 4.879999999999174 | 0.453 | 0.36 |  |
| 4.859999999999175 | 0.454 | 0.36 |  |
| 4.839999999999175 | 0.455 | 0.361 |  |
| 4.819999999999176 | 0.455 | 0.361 |  |
| 4.799999999999176 | 0.456 | 0.361 |  |
| 4.779999999999176 | 0.457 | 0.362 |  |
| 4.759999999999177 | 0.458 | 0.362 |  |
| 4.739999999999177 | 0.459 | 0.362 |  |
| 4.719999999999178 | 0.46 | 0.363 |  |
| 4.699999999999178 | 0.461 | 0.363 |  |
| 4.679999999999178 | 0.462 | 0.363 |  |
| 4.65999999999918 | 0.463 | 0.364 |  |
| 4.63999999999918 | 0.464 | 0.364 |  |
| 4.61999999999918 | 0.465 | 0.365 |  |
| 4.59999999999918 | 0.466 | 0.365 |  |
| 4.57999999999918 | 0.467 | 0.365 |  |
| 4.559999999999181 | 0.468 | 0.366 |  |
| 4.539999999999182 | 0.469 | 0.366 |  |
| 4.519999999999182 | 0.47 | 0.366 |  |
| 4.499999999999182 | 0.471 | 0.367 |  |
| 4.479999999999183 | 0.472 | 0.367 |  |
| 4.459999999999183 | 0.474 | 0.367 |  |
| 4.439999999999184 | 0.475 | 0.368 |  |
| 4.419999999999184 | 0.476 | 0.368 |  |
| 4.399999999999184 | 0.477 | 0.368 |  |
| 4.379999999999185 | 0.478 | 0.369 |  |
| 4.359999999999185 | 0.479 | 0.369 |  |
| 4.339999999999186 | 0.48 | 0.369 |  |
| 4.319999999999186 | 0.481 | 0.37 |  |
| 4.299999999999187 | 0.482 | 0.37 |  |
| 4.279999999999187 | 0.483 | 0.37 |  |
| 4.259999999999187 | 0.485 | 0.371 |  |
| 4.239999999999188 | 0.486 | 0.371 |  |
| 4.219999999999188 | 0.487 | 0.371 |  |
| 4.19999999999919 | 0.488 | 0.372 |  |
| 4.17999999999919 | 0.489 | 0.372 |  |
| 4.15999999999919 | 0.49 | 0.372 |  |
| 4.13999999999919 | 0.491 | 0.373 |  |
| 4.119999999999191 | 0.493 | 0.373 |  |
| 4.099999999999191 | 0.494 | 0.373 |  |
| 4.079999999999191 | 0.495 | 0.374 |  |
| 4.059999999999192 | 0.496 | 0.374 |  |
| 4.039999999999192 | 0.498 | 0.374 |  |
| 4.019999999999193 | 0.499 | 0.375 |  |
| 3.999999999999193 | 0.5 | 0.375 |  |
| 3.979999999999193 | 0.501 | 0.375 |  |
| 3.959999999999193 | 0.503 | 0.376 |  |
| 3.939999999999193 | 0.504 | 0.376 |  |
| 3.919999999999193 | 0.505 | 0.376 |  |
| 3.899999999999193 | 0.506 | 0.377 |  |
| 3.879999999999193 | 0.508 | 0.377 |  |
| 3.859999999999193 | 0.509 | 0.377 |  |
| 3.839999999999193 | 0.51 | 0.377 |  |
| 3.819999999999193 | 0.512 | 0.378 |  |
| 3.799999999999193 | 0.513 | 0.378 |  |
| 3.779999999999193 | 0.514 | 0.378 |  |
| 3.759999999999193 | 0.516 | 0.379 |  |
| 3.739999999999193 | 0.517 | 0.379 |  |
| 3.719999999999193 | 0.518 | 0.379 |  |
| 3.699999999999193 | 0.52 | 0.379 |  |
| 3.679999999999193 | 0.521 | 0.38 |  |
| 3.659999999999193 | 0.523 | 0.38 |  |
| 3.639999999999193 | 0.524 | 0.38 |  |
| 3.619999999999193 | 0.526 | 0.38 |  |
| 3.599999999999193 | 0.527 | 0.381 |  |
| 3.579999999999193 | 0.529 | 0.381 |  |
| 3.559999999999193 | 0.53 | 0.381 |  |
| 3.539999999999193 | 0.531 | 0.381 |  |
| 3.519999999999193 | 0.533 | 0.382 |  |
| 3.499999999999193 | 0.535 | 0.382 |  |
| 3.479999999999193 | 0.536 | 0.382 |  |
| 3.459999999999193 | 0.538 | 0.382 |  |
| 3.439999999999193 | 0.539 | 0.382 |  |
| 3.419999999999193 | 0.541 | 0.383 |  |
| 3.399999999999192 | 0.542 | 0.383 |  |
| 3.379999999999192 | 0.544 | 0.383 |  |
| 3.359999999999192 | 0.546 | 0.383 |  |
| 3.339999999999192 | 0.547 | 0.383 |  |
| 3.319999999999192 | 0.549 | 0.384 |  |
| 3.299999999999192 | 0.55 | 0.384 |  |
| 3.279999999999192 | 0.552 | 0.384 |  |
| 3.259999999999192 | 0.554 | 0.384 |  |
| 3.239999999999192 | 0.556 | 0.384 |  |
| 3.219999999999192 | 0.557 | 0.384 |  |
| 3.199999999999192 | 0.559 | 0.384 |  |
| 3.179999999999192 | 0.561 | 0.384 |  |
| 3.159999999999192 | 0.563 | 0.385 |  |
| 3.139999999999192 | 0.564 | 0.385 |  |
| 3.119999999999192 | 0.566 | 0.385 |  |
| 3.099999999999192 | 0.568 | 0.385 |  |
| 3.079999999999192 | 0.57 | 0.385 |  |
| 3.059999999999192 | 0.572 | 0.385 |  |
| 3.039999999999192 | 0.574 | 0.385 |  |
| 3.019999999999192 | 0.575 | 0.385 |  |
| 2.999999999999192 | 0.577 | 0.385 |  |
| 2.979999999999192 | 0.579 | 0.385 |  |
| 2.959999999999192 | 0.581 | 0.385 |  |
| 2.939999999999192 | 0.583 | 0.385 |  |
| 2.919999999999192 | 0.585 | 0.385 |  |
| 2.899999999999192 | 0.587 | 0.385 |  |
| 2.879999999999192 | 0.589 | 0.385 |  |
| 2.859999999999192 | 0.591 | 0.385 |  |
| 2.839999999999192 | 0.593 | 0.384 |  |
| 2.819999999999192 | 0.595 | 0.384 |  |
| 2.799999999999192 | 0.598 | 0.384 |  |
| 2.779999999999192 | 0.6 | 0.384 |  |
| 2.759999999999192 | 0.602 | 0.384 |  |
| 2.739999999999192 | 0.604 | 0.384 |  |
| 2.719999999999192 | 0.606 | 0.383 |  |
| 2.699999999999192 | 0.609 | 0.383 |  |
| 2.679999999999192 | 0.611 | 0.383 |  |
| 2.659999999999192 | 0.613 | 0.383 |  |
| 2.639999999999192 | 0.615 | 0.382 |  |
| 2.619999999999192 | 0.618 | 0.382 |  |
| 2.599999999999192 | 0.62 | 0.382 |  |
| 2.579999999999192 | 0.623 | 0.381 |  |
| 2.559999999999192 | 0.625 | 0.381 |  |
| 2.539999999999192 | 0.627 | 0.38 |  |
| 2.519999999999192 | 0.63 | 0.38 |  |
| 2.499999999999192 | 0.632 | 0.379 |  |
| 2.479999999999192 | 0.635 | 0.379 |  |
| 2.459999999999192 | 0.638 | 0.378 |  |
| 2.439999999999192 | 0.64 | 0.378 |  |
| 2.419999999999192 | 0.643 | 0.377 |  |
| 2.399999999999192 | 0.645 | 0.377 |  |
| 2.379999999999192 | 0.648 | 0.376 |  |
| 2.359999999999192 | 0.651 | 0.375 |  |
| 2.339999999999192 | 0.654 | 0.374 |  |
| 2.319999999999192 | 0.657 | 0.374 |  |
| 2.299999999999192 | 0.659 | 0.373 |  |
| 2.279999999999192 | 0.662 | 0.372 |  |
| 2.259999999999192 | 0.665 | 0.371 |  |
| 2.239999999999192 | 0.668 | 0.37 |  |
| 2.219999999999191 | 0.671 | 0.369 |  |
| 2.199999999999191 | 0.674 | 0.368 |  |
| 2.179999999999191 | 0.677 | 0.367 |  |
| 2.159999999999191 | 0.68 | 0.365 |  |
| 2.139999999999191 | 0.684 | 0.364 |  |
| 2.119999999999191 | 0.687 | 0.363 |  |
| 2.099999999999191 | 0.69 | 0.361 |  |
| 2.079999999999191 | 0.693 | 0.36 |  |
| 2.059999999999191 | 0.697 | 0.359 |  |
| 2.039999999999191 | 0.7 | 0.357 |  |
| 2.019999999999191 | 0.704 | 0.355 |  |
| 1.999999999999191 | 0.707 | 0.354 |  |
| 1.979999999999191 | 0.711 | 0.352 |  |
| 1.959999999999191 | 0.714 | 0.35 |  |
| 1.939999999999191 | 0.718 | 0.348 |  |
| 1.919999999999191 | 0.722 | 0.346 |  |
| 1.899999999999191 | 0.725 | 0.344 |  |
| 1.879999999999191 | 0.729 | 0.341 |  |
| 1.859999999999191 | 0.733 | 0.339 |  |
| 1.839999999999191 | 0.737 | 0.337 |  |
| 1.819999999999191 | 0.741 | 0.334 |  |
| 1.799999999999191 | 0.745 | 0.331 |  |
| 1.779999999999191 | 0.75 | 0.328 |  |
| 1.759999999999191 | 0.754 | 0.325 |  |
| 1.739999999999191 | 0.758 | 0.322 |  |
| 1.719999999999191 | 0.762 | 0.319 |  |
| 1.699999999999191 | 0.767 | 0.316 |  |
| 1.679999999999191 | 0.772 | 0.312 |  |
| 1.659999999999191 | 0.776 | 0.309 |  |
| 1.639999999999191 | 0.781 | 0.305 |  |
| 1.619999999999191 | 0.786 | 0.301 |  |
| 1.599999999999191 | 0.791 | 0.296 |  |
| 1.579999999999191 | 0.796 | 0.292 |  |
| 1.559999999999191 | 0.801 | 0.287 |  |
| 1.539999999999191 | 0.806 | 0.283 |  |
| 1.519999999999191 | 0.811 | 0.277 |  |
| 1.499999999999191 | 0.816 | 0.272 |  |
| 1.479999999999191 | 0.822 | 0.267 |  |
| 1.459999999999191 | 0.828 | 0.261 |  |
| 1.439999999999191 | 0.833 | 0.255 |  |
| 1.419999999999191 | 0.839 | 0.248 |  |
| 1.399999999999191 | 0.845 | 0.241 |  |
| 1.379999999999191 | 0.851 | 0.234 |  |
| 1.359999999999191 | 0.857 | 0.227 |  |
| 1.339999999999191 | 0.864 | 0.219 |  |
| 1.319999999999191 | 0.87 | 0.211 |  |
| 1.299999999999191 | 0.877 | 0.202 |  |
| 1.279999999999191 | 0.884 | 0.193 |  |
| 1.259999999999191 | 0.891 | 0.184 |  |
| 1.239999999999191 | 0.898 | 0.174 |  |
| 1.219999999999191 | 0.905 | 0.163 |  |
| 1.199999999999191 | 0.913 | 0.152 |  |
| 1.179999999999191 | 0.921 | 0.14 |  |
| 1.159999999999191 | 0.928 | 0.128 |  |
| 1.139999999999191 | 0.937 | 0.115 |  |
| 1.119999999999191 | 0.945 | 0.101 |  |
| 1.09999999999919 | 0.953 | 0.087 |  |
| 1.07999999999919 | 0.962 | 0.071 |  |
| 1.05999999999919 | 0.971 | 0.055 |  |
| 1.03999999999919 | 0.981 | 0.038 |  |
| 1.01999999999919 | 0.99 | 0.019 |  |
| 0.99999999999919 | 1 | 0 |  |